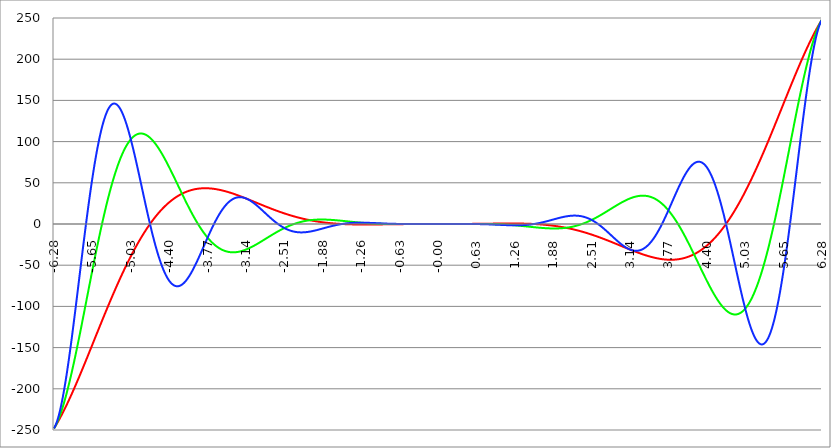
| Category | Series 1 | Series 0 | Series 2 |
|---|---|---|---|
| -6.283185307179586 | -248.05 | -248.05 | -248.05 |
| -6.276902121872407 | -247.302 | -247.287 | -247.263 |
| -6.270618936565228 | -246.545 | -246.487 | -246.39 |
| -6.264335751258049 | -245.781 | -245.65 | -245.432 |
| -6.25805256595087 | -245.008 | -244.776 | -244.389 |
| -6.25176938064369 | -244.227 | -243.866 | -243.264 |
| -6.245486195336511 | -243.439 | -242.92 | -242.056 |
| -6.23920301002933 | -242.643 | -241.938 | -240.766 |
| -6.232919824722153 | -241.839 | -240.922 | -239.397 |
| -6.226636639414973 | -241.027 | -239.871 | -237.947 |
| -6.220353454107794 | -240.208 | -238.785 | -236.42 |
| -6.214070268800615 | -239.381 | -237.665 | -234.815 |
| -6.207787083493435 | -238.547 | -236.512 | -233.133 |
| -6.201503898186257 | -237.706 | -235.326 | -231.377 |
| -6.195220712879077 | -236.858 | -234.107 | -229.546 |
| -6.188937527571898 | -236.002 | -232.856 | -227.642 |
| -6.182654342264719 | -235.14 | -231.572 | -225.666 |
| -6.17637115695754 | -234.271 | -230.258 | -223.62 |
| -6.170087971650361 | -233.394 | -228.912 | -221.504 |
| -6.163804786343182 | -232.512 | -227.535 | -219.32 |
| -6.157521601036002 | -231.622 | -226.128 | -217.068 |
| -6.151238415728823 | -230.726 | -224.692 | -214.751 |
| -6.144955230421644 | -229.823 | -223.225 | -212.369 |
| -6.138672045114464 | -228.914 | -221.73 | -209.924 |
| -6.132388859807286 | -227.999 | -220.207 | -207.417 |
| -6.126105674500106 | -227.077 | -218.655 | -204.849 |
| -6.119822489192927 | -226.149 | -217.076 | -202.222 |
| -6.113539303885748 | -225.216 | -215.469 | -199.537 |
| -6.107256118578569 | -224.276 | -213.836 | -196.795 |
| -6.10097293327139 | -223.33 | -212.176 | -193.998 |
| -6.09468974796421 | -222.379 | -210.491 | -191.146 |
| -6.088406562657031 | -221.422 | -208.78 | -188.243 |
| -6.082123377349852 | -220.459 | -207.044 | -185.288 |
| -6.075840192042672 | -219.491 | -205.284 | -182.283 |
| -6.069557006735494 | -218.517 | -203.499 | -179.23 |
| -6.063273821428314 | -217.538 | -201.691 | -176.13 |
| -6.056990636121135 | -216.553 | -199.86 | -172.985 |
| -6.050707450813956 | -215.564 | -198.006 | -169.796 |
| -6.044424265506777 | -214.569 | -196.13 | -166.564 |
| -6.038141080199597 | -213.569 | -194.232 | -163.291 |
| -6.031857894892418 | -212.564 | -192.313 | -159.979 |
| -6.025574709585239 | -211.555 | -190.373 | -156.628 |
| -6.01929152427806 | -210.54 | -188.413 | -153.241 |
| -6.013008338970881 | -209.521 | -186.433 | -149.819 |
| -6.006725153663701 | -208.497 | -184.434 | -146.363 |
| -6.000441968356522 | -207.469 | -182.415 | -142.875 |
| -5.994158783049343 | -206.437 | -180.378 | -139.356 |
| -5.987875597742164 | -205.4 | -178.323 | -135.809 |
| -5.981592412434984 | -204.358 | -176.251 | -132.233 |
| -5.975309227127805 | -203.313 | -174.161 | -128.632 |
| -5.969026041820626 | -202.263 | -172.055 | -125.005 |
| -5.962742856513447 | -201.209 | -169.933 | -121.356 |
| -5.956459671206268 | -200.152 | -167.795 | -117.685 |
| -5.950176485899088 | -199.09 | -165.642 | -113.995 |
| -5.94389330059191 | -198.025 | -163.475 | -110.285 |
| -5.93761011528473 | -196.956 | -161.293 | -106.559 |
| -5.931326929977551 | -195.884 | -159.097 | -102.816 |
| -5.925043744670372 | -194.807 | -156.888 | -99.06 |
| -5.918760559363193 | -193.728 | -154.667 | -95.291 |
| -5.912477374056014 | -192.645 | -152.433 | -91.511 |
| -5.906194188748834 | -191.559 | -150.187 | -87.722 |
| -5.899911003441655 | -190.469 | -147.93 | -83.924 |
| -5.893627818134476 | -189.377 | -145.662 | -80.12 |
| -5.887344632827297 | -188.281 | -143.383 | -76.31 |
| -5.881061447520117 | -187.182 | -141.094 | -72.497 |
| -5.874778262212938 | -186.081 | -138.796 | -68.681 |
| -5.868495076905759 | -184.976 | -136.489 | -64.865 |
| -5.86221189159858 | -183.869 | -134.173 | -61.049 |
| -5.855928706291401 | -182.759 | -131.85 | -57.235 |
| -5.849645520984221 | -181.647 | -129.518 | -53.424 |
| -5.843362335677042 | -180.532 | -127.179 | -49.619 |
| -5.837079150369863 | -179.415 | -124.834 | -45.819 |
| -5.830795965062684 | -178.295 | -122.482 | -42.028 |
| -5.824512779755505 | -177.173 | -120.125 | -38.245 |
| -5.818229594448325 | -176.049 | -117.762 | -34.472 |
| -5.811946409141146 | -174.923 | -115.394 | -30.711 |
| -5.805663223833967 | -173.794 | -113.022 | -26.963 |
| -5.799380038526788 | -172.664 | -110.645 | -23.23 |
| -5.793096853219609 | -171.532 | -108.266 | -19.512 |
| -5.78681366791243 | -170.398 | -105.883 | -15.811 |
| -5.780530482605251 | -169.262 | -103.497 | -12.128 |
| -5.774247297298071 | -168.124 | -101.109 | -8.465 |
| -5.767964111990892 | -166.985 | -98.719 | -4.822 |
| -5.761680926683713 | -165.845 | -96.328 | -1.202 |
| -5.755397741376534 | -164.703 | -93.936 | 2.396 |
| -5.749114556069355 | -163.56 | -91.544 | 5.969 |
| -5.742831370762175 | -162.415 | -89.151 | 9.516 |
| -5.736548185454996 | -161.269 | -86.759 | 13.037 |
| -5.730265000147816 | -160.122 | -84.367 | 16.53 |
| -5.723981814840638 | -158.974 | -81.977 | 19.994 |
| -5.717698629533459 | -157.825 | -79.588 | 23.428 |
| -5.711415444226279 | -156.675 | -77.201 | 26.83 |
| -5.7051322589191 | -155.524 | -74.817 | 30.201 |
| -5.698849073611921 | -154.372 | -72.436 | 33.538 |
| -5.692565888304742 | -153.219 | -70.058 | 36.84 |
| -5.686282702997562 | -152.066 | -67.683 | 40.108 |
| -5.679999517690383 | -150.913 | -65.313 | 43.339 |
| -5.673716332383204 | -149.758 | -62.947 | 46.532 |
| -5.667433147076025 | -148.604 | -60.585 | 49.687 |
| -5.661149961768846 | -147.449 | -58.229 | 52.803 |
| -5.654866776461667 | -146.293 | -55.879 | 55.879 |
| -5.648583591154487 | -145.138 | -53.535 | 58.914 |
| -5.642300405847308 | -143.982 | -51.197 | 61.907 |
| -5.63601722054013 | -142.826 | -48.866 | 64.857 |
| -5.62973403523295 | -141.67 | -46.541 | 67.763 |
| -5.623450849925771 | -140.514 | -44.225 | 70.625 |
| -5.617167664618591 | -139.359 | -41.916 | 73.442 |
| -5.610884479311412 | -138.203 | -39.616 | 76.213 |
| -5.604601294004233 | -137.048 | -37.324 | 78.938 |
| -5.598318108697054 | -135.893 | -35.041 | 81.614 |
| -5.592034923389875 | -134.738 | -32.767 | 84.243 |
| -5.585751738082695 | -133.584 | -30.503 | 86.823 |
| -5.579468552775516 | -132.43 | -28.249 | 89.354 |
| -5.573185367468337 | -131.276 | -26.005 | 91.834 |
| -5.566902182161157 | -130.124 | -23.772 | 94.264 |
| -5.560618996853979 | -128.972 | -21.549 | 96.643 |
| -5.5543358115468 | -127.821 | -19.338 | 98.97 |
| -5.54805262623962 | -126.67 | -17.139 | 101.245 |
| -5.54176944093244 | -125.521 | -14.952 | 103.466 |
| -5.535486255625262 | -124.372 | -12.777 | 105.635 |
| -5.529203070318083 | -123.224 | -10.614 | 107.75 |
| -5.522919885010904 | -122.078 | -8.464 | 109.81 |
| -5.516636699703724 | -120.932 | -6.328 | 111.816 |
| -5.510353514396545 | -119.788 | -4.205 | 113.767 |
| -5.504070329089366 | -118.645 | -2.095 | 115.663 |
| -5.497787143782186 | -117.503 | 0 | 117.503 |
| -5.491503958475008 | -116.362 | 2.081 | 119.287 |
| -5.485220773167828 | -115.223 | 4.147 | 121.015 |
| -5.47893758786065 | -114.086 | 6.199 | 122.686 |
| -5.47265440255347 | -112.95 | 8.235 | 124.3 |
| -5.466371217246291 | -111.815 | 10.256 | 125.857 |
| -5.460088031939112 | -110.682 | 12.262 | 127.357 |
| -5.453804846631932 | -109.551 | 14.251 | 128.799 |
| -5.447521661324753 | -108.422 | 16.224 | 130.184 |
| -5.441238476017574 | -107.294 | 18.181 | 131.512 |
| -5.434955290710395 | -106.168 | 20.121 | 132.781 |
| -5.428672105403215 | -105.044 | 22.044 | 133.992 |
| -5.422388920096036 | -103.922 | 23.951 | 135.146 |
| -5.416105734788857 | -102.802 | 25.839 | 136.241 |
| -5.409822549481678 | -101.685 | 27.71 | 137.279 |
| -5.403539364174499 | -100.569 | 29.564 | 138.258 |
| -5.39725617886732 | -99.455 | 31.399 | 139.18 |
| -5.39097299356014 | -98.344 | 33.216 | 140.043 |
| -5.384689808252961 | -97.235 | 35.015 | 140.849 |
| -5.378406622945782 | -96.128 | 36.795 | 141.597 |
| -5.372123437638603 | -95.024 | 38.556 | 142.287 |
| -5.365840252331424 | -93.922 | 40.299 | 142.919 |
| -5.359557067024244 | -92.823 | 42.022 | 143.495 |
| -5.353273881717065 | -91.726 | 43.725 | 144.013 |
| -5.346990696409886 | -90.631 | 45.409 | 144.474 |
| -5.340707511102707 | -89.54 | 47.074 | 144.878 |
| -5.334424325795528 | -88.451 | 48.718 | 145.226 |
| -5.328141140488348 | -87.364 | 50.343 | 145.517 |
| -5.32185795518117 | -86.281 | 51.947 | 145.753 |
| -5.31557476987399 | -85.2 | 53.531 | 145.933 |
| -5.30929158456681 | -84.122 | 55.094 | 146.057 |
| -5.303008399259631 | -83.047 | 56.637 | 146.126 |
| -5.296725213952453 | -81.975 | 58.159 | 146.141 |
| -5.290442028645273 | -80.906 | 59.66 | 146.102 |
| -5.284158843338094 | -79.84 | 61.139 | 146.008 |
| -5.277875658030915 | -78.777 | 62.598 | 145.861 |
| -5.271592472723735 | -77.718 | 64.036 | 145.661 |
| -5.265309287416557 | -76.661 | 65.452 | 145.408 |
| -5.259026102109377 | -75.608 | 66.846 | 145.103 |
| -5.252742916802198 | -74.558 | 68.219 | 144.747 |
| -5.246459731495019 | -73.511 | 69.57 | 144.339 |
| -5.24017654618784 | -72.468 | 70.9 | 143.881 |
| -5.23389336088066 | -71.427 | 72.207 | 143.373 |
| -5.227610175573481 | -70.391 | 73.493 | 142.815 |
| -5.221326990266302 | -69.358 | 74.756 | 142.207 |
| -5.215043804959122 | -68.328 | 75.997 | 141.552 |
| -5.208760619651944 | -67.302 | 77.216 | 140.849 |
| -5.202477434344764 | -66.279 | 78.413 | 140.098 |
| -5.196194249037585 | -65.26 | 79.588 | 139.301 |
| -5.189911063730406 | -64.245 | 80.74 | 138.458 |
| -5.183627878423227 | -63.234 | 81.869 | 137.569 |
| -5.177344693116048 | -62.226 | 82.976 | 136.636 |
| -5.171061507808868 | -61.222 | 84.061 | 135.659 |
| -5.164778322501689 | -60.221 | 85.123 | 134.638 |
| -5.15849513719451 | -59.225 | 86.162 | 133.575 |
| -5.152211951887331 | -58.233 | 87.179 | 132.47 |
| -5.145928766580152 | -57.244 | 88.172 | 131.324 |
| -5.139645581272972 | -56.259 | 89.144 | 130.137 |
| -5.133362395965793 | -55.279 | 90.092 | 128.911 |
| -5.127079210658614 | -54.302 | 91.018 | 127.645 |
| -5.120796025351435 | -53.329 | 91.921 | 126.342 |
| -5.114512840044256 | -52.361 | 92.802 | 125.001 |
| -5.108229654737076 | -51.396 | 93.659 | 123.623 |
| -5.101946469429897 | -50.436 | 94.494 | 122.209 |
| -5.095663284122718 | -49.48 | 95.306 | 120.761 |
| -5.08938009881554 | -48.528 | 96.096 | 119.278 |
| -5.08309691350836 | -47.58 | 96.862 | 117.762 |
| -5.07681372820118 | -46.636 | 97.606 | 116.213 |
| -5.070530542894002 | -45.697 | 98.328 | 114.632 |
| -5.064247357586822 | -44.762 | 99.027 | 113.02 |
| -5.057964172279643 | -43.832 | 99.703 | 111.378 |
| -5.051680986972464 | -42.906 | 100.356 | 109.707 |
| -5.045397801665285 | -41.984 | 100.988 | 108.007 |
| -5.039114616358106 | -41.067 | 101.596 | 106.28 |
| -5.032831431050926 | -40.154 | 102.183 | 104.526 |
| -5.026548245743747 | -39.246 | 102.747 | 102.747 |
| -5.020265060436568 | -38.342 | 103.288 | 100.942 |
| -5.013981875129389 | -37.443 | 103.808 | 99.113 |
| -5.00769868982221 | -36.548 | 104.305 | 97.261 |
| -5.00141550451503 | -35.658 | 104.78 | 95.386 |
| -4.995132319207851 | -34.772 | 105.233 | 93.49 |
| -4.98884913390067 | -33.891 | 105.664 | 91.574 |
| -4.982565948593493 | -33.015 | 106.073 | 89.637 |
| -4.976282763286313 | -32.143 | 106.461 | 87.682 |
| -4.969999577979134 | -31.277 | 106.827 | 85.709 |
| -4.963716392671955 | -30.414 | 107.171 | 83.719 |
| -4.957433207364776 | -29.557 | 107.494 | 81.713 |
| -4.951150022057597 | -28.704 | 107.795 | 79.691 |
| -4.944866836750418 | -27.856 | 108.075 | 77.655 |
| -4.938583651443238 | -27.013 | 108.333 | 75.606 |
| -4.932300466136059 | -26.175 | 108.571 | 73.543 |
| -4.92601728082888 | -25.342 | 108.788 | 71.469 |
| -4.9197340955217 | -24.513 | 108.983 | 69.385 |
| -4.913450910214521 | -23.69 | 109.158 | 67.29 |
| -4.907167724907342 | -22.871 | 109.313 | 65.186 |
| -4.900884539600163 | -22.057 | 109.447 | 63.074 |
| -4.894601354292984 | -21.248 | 109.56 | 60.954 |
| -4.888318168985805 | -20.444 | 109.653 | 58.828 |
| -4.882034983678625 | -19.645 | 109.726 | 56.696 |
| -4.875751798371446 | -18.851 | 109.779 | 54.56 |
| -4.869468613064267 | -18.062 | 109.812 | 52.419 |
| -4.863185427757088 | -17.279 | 109.826 | 50.276 |
| -4.856902242449909 | -16.5 | 109.82 | 48.13 |
| -4.85061905714273 | -15.726 | 109.794 | 45.983 |
| -4.84433587183555 | -14.957 | 109.749 | 43.835 |
| -4.838052686528371 | -14.193 | 109.685 | 41.688 |
| -4.831769501221192 | -13.434 | 109.602 | 39.541 |
| -4.825486315914013 | -12.681 | 109.501 | 37.397 |
| -4.819203130606833 | -11.932 | 109.38 | 35.255 |
| -4.812919945299654 | -11.189 | 109.242 | 33.116 |
| -4.806636759992475 | -10.451 | 109.084 | 30.982 |
| -4.800353574685296 | -9.718 | 108.909 | 28.853 |
| -4.794070389378117 | -8.99 | 108.716 | 26.73 |
| -4.787787204070938 | -8.267 | 108.505 | 24.614 |
| -4.781504018763758 | -7.55 | 108.276 | 22.505 |
| -4.77522083345658 | -6.837 | 108.029 | 20.404 |
| -4.7689376481494 | -6.13 | 107.766 | 18.311 |
| -4.762654462842221 | -5.428 | 107.485 | 16.229 |
| -4.756371277535042 | -4.731 | 107.188 | 14.157 |
| -4.750088092227862 | -4.04 | 106.873 | 12.096 |
| -4.743804906920683 | -3.353 | 106.542 | 10.046 |
| -4.737521721613504 | -2.672 | 106.195 | 8.009 |
| -4.731238536306324 | -1.996 | 105.832 | 5.986 |
| -4.724955350999146 | -1.326 | 105.452 | 3.976 |
| -4.718672165691966 | -0.66 | 105.057 | 1.98 |
| -4.712388980384787 | 0 | 104.646 | 0 |
| -4.706105795077608 | 0.655 | 104.22 | -1.965 |
| -4.699822609770429 | 1.304 | 103.778 | -3.913 |
| -4.69353942446325 | 1.949 | 103.322 | -5.844 |
| -4.68725623915607 | 2.588 | 102.851 | -7.757 |
| -4.680973053848891 | 3.222 | 102.365 | -9.652 |
| -4.674689868541712 | 3.85 | 101.864 | -11.529 |
| -4.668406683234533 | 4.473 | 101.35 | -13.386 |
| -4.662123497927354 | 5.091 | 100.821 | -15.223 |
| -4.655840312620174 | 5.704 | 100.279 | -17.039 |
| -4.649557127312995 | 6.311 | 99.723 | -18.835 |
| -4.643273942005816 | 6.914 | 99.154 | -20.609 |
| -4.636990756698637 | 7.51 | 98.572 | -22.36 |
| -4.630707571391458 | 8.102 | 97.976 | -24.09 |
| -4.624424386084279 | 8.688 | 97.368 | -25.796 |
| -4.618141200777099 | 9.269 | 96.748 | -27.478 |
| -4.61185801546992 | 9.845 | 96.115 | -29.137 |
| -4.605574830162741 | 10.415 | 95.47 | -30.771 |
| -4.599291644855561 | 10.98 | 94.813 | -32.38 |
| -4.593008459548383 | 11.54 | 94.144 | -33.964 |
| -4.586725274241203 | 12.094 | 93.464 | -35.522 |
| -4.580442088934024 | 12.643 | 92.773 | -37.055 |
| -4.574158903626845 | 13.187 | 92.071 | -38.56 |
| -4.567875718319666 | 13.726 | 91.358 | -40.039 |
| -4.561592533012487 | 14.259 | 90.634 | -41.49 |
| -4.555309347705307 | 14.787 | 89.9 | -42.914 |
| -4.549026162398128 | 15.31 | 89.156 | -44.31 |
| -4.542742977090949 | 15.828 | 88.402 | -45.678 |
| -4.53645979178377 | 16.34 | 87.638 | -47.017 |
| -4.530176606476591 | 16.847 | 86.865 | -48.328 |
| -4.523893421169412 | 17.349 | 86.083 | -49.609 |
| -4.517610235862232 | 17.845 | 85.291 | -50.861 |
| -4.511327050555053 | 18.336 | 84.491 | -52.084 |
| -4.505043865247874 | 18.822 | 83.682 | -53.276 |
| -4.498760679940694 | 19.303 | 82.865 | -54.439 |
| -4.492477494633515 | 19.779 | 82.04 | -55.572 |
| -4.486194309326336 | 20.249 | 81.206 | -56.674 |
| -4.479911124019157 | 20.714 | 80.365 | -57.745 |
| -4.473627938711977 | 21.174 | 79.517 | -58.786 |
| -4.467344753404799 | 21.629 | 78.661 | -59.795 |
| -4.46106156809762 | 22.079 | 77.798 | -60.774 |
| -4.45477838279044 | 22.523 | 76.929 | -61.722 |
| -4.44849519748326 | 22.962 | 76.053 | -62.638 |
| -4.442212012176082 | 23.396 | 75.17 | -63.523 |
| -4.435928826868903 | 23.825 | 74.281 | -64.376 |
| -4.429645641561723 | 24.249 | 73.387 | -65.198 |
| -4.423362456254544 | 24.668 | 72.486 | -65.988 |
| -4.417079270947365 | 25.081 | 71.581 | -66.747 |
| -4.410796085640185 | 25.49 | 70.669 | -67.473 |
| -4.404512900333007 | 25.893 | 69.753 | -68.169 |
| -4.398229715025827 | 26.292 | 68.832 | -68.832 |
| -4.391946529718648 | 26.685 | 67.906 | -69.464 |
| -4.38566334441147 | 27.073 | 66.976 | -70.064 |
| -4.37938015910429 | 27.456 | 66.042 | -70.633 |
| -4.373096973797111 | 27.834 | 65.104 | -71.17 |
| -4.366813788489932 | 28.207 | 64.161 | -71.675 |
| -4.360530603182752 | 28.575 | 63.216 | -72.149 |
| -4.354247417875573 | 28.938 | 62.267 | -72.591 |
| -4.347964232568394 | 29.296 | 61.314 | -73.002 |
| -4.341681047261215 | 29.649 | 60.359 | -73.382 |
| -4.335397861954035 | 29.997 | 59.401 | -73.731 |
| -4.329114676646856 | 30.34 | 58.441 | -74.049 |
| -4.322831491339677 | 30.679 | 57.478 | -74.337 |
| -4.316548306032498 | 31.012 | 56.513 | -74.593 |
| -4.310265120725319 | 31.34 | 55.546 | -74.819 |
| -4.30398193541814 | 31.664 | 54.578 | -75.015 |
| -4.29769875011096 | 31.982 | 53.608 | -75.18 |
| -4.291415564803781 | 32.296 | 52.636 | -75.316 |
| -4.285132379496602 | 32.605 | 51.664 | -75.421 |
| -4.278849194189422 | 32.909 | 50.69 | -75.498 |
| -4.272566008882244 | 33.209 | 49.716 | -75.545 |
| -4.266282823575064 | 33.503 | 48.741 | -75.562 |
| -4.259999638267885 | 33.793 | 47.766 | -75.551 |
| -4.253716452960706 | 34.078 | 46.791 | -75.512 |
| -4.247433267653527 | 34.358 | 45.815 | -75.444 |
| -4.241150082346347 | 34.634 | 44.84 | -75.348 |
| -4.234866897039168 | 34.904 | 43.866 | -75.224 |
| -4.228583711731989 | 35.171 | 42.892 | -75.073 |
| -4.22230052642481 | 35.432 | 41.918 | -74.894 |
| -4.216017341117631 | 35.689 | 40.946 | -74.689 |
| -4.209734155810452 | 35.941 | 39.975 | -74.457 |
| -4.203450970503273 | 36.188 | 39.005 | -74.199 |
| -4.197167785196093 | 36.431 | 38.037 | -73.915 |
| -4.190884599888914 | 36.67 | 37.07 | -73.605 |
| -4.184601414581734 | 36.904 | 36.105 | -73.27 |
| -4.178318229274556 | 37.133 | 35.142 | -72.911 |
| -4.172035043967377 | 37.358 | 34.182 | -72.526 |
| -4.165751858660197 | 37.578 | 33.223 | -72.118 |
| -4.159468673353018 | 37.794 | 32.267 | -71.685 |
| -4.153185488045839 | 38.005 | 31.314 | -71.23 |
| -4.14690230273866 | 38.212 | 30.364 | -70.751 |
| -4.140619117431481 | 38.414 | 29.416 | -70.25 |
| -4.134335932124301 | 38.612 | 28.472 | -69.726 |
| -4.128052746817122 | 38.806 | 27.531 | -69.181 |
| -4.121769561509943 | 38.995 | 26.594 | -68.614 |
| -4.115486376202764 | 39.18 | 25.66 | -68.026 |
| -4.109203190895584 | 39.361 | 24.73 | -67.418 |
| -4.102920005588405 | 39.537 | 23.804 | -66.789 |
| -4.096636820281226 | 39.709 | 22.882 | -66.141 |
| -4.090353634974047 | 39.877 | 21.964 | -65.473 |
| -4.084070449666868 | 40.04 | 21.05 | -64.787 |
| -4.077787264359689 | 40.2 | 20.141 | -64.082 |
| -4.071504079052509 | 40.355 | 19.237 | -63.359 |
| -4.06522089374533 | 40.506 | 18.337 | -62.618 |
| -4.058937708438151 | 40.653 | 17.443 | -61.861 |
| -4.052654523130972 | 40.796 | 16.553 | -61.087 |
| -4.046371337823793 | 40.934 | 15.668 | -60.296 |
| -4.040088152516613 | 41.069 | 14.789 | -59.49 |
| -4.033804967209434 | 41.199 | 13.915 | -58.669 |
| -4.027521781902255 | 41.326 | 13.047 | -57.832 |
| -4.021238596595076 | 41.448 | 12.184 | -56.982 |
| -4.014955411287897 | 41.567 | 11.328 | -56.117 |
| -4.008672225980717 | 41.682 | 10.477 | -55.239 |
| -4.002389040673538 | 41.792 | 9.632 | -54.349 |
| -3.996105855366359 | 41.899 | 8.793 | -53.445 |
| -3.989822670059179 | 42.002 | 7.96 | -52.53 |
| -3.983539484752 | 42.101 | 7.134 | -51.603 |
| -3.97725629944482 | 42.196 | 6.314 | -50.666 |
| -3.97097311413764 | 42.287 | 5.501 | -49.717 |
| -3.96468992883046 | 42.375 | 4.694 | -48.759 |
| -3.958406743523281 | 42.458 | 3.895 | -47.79 |
| -3.952123558216101 | 42.539 | 3.102 | -46.813 |
| -3.945840372908922 | 42.615 | 2.316 | -45.827 |
| -3.939557187601742 | 42.687 | 1.537 | -44.833 |
| -3.933274002294562 | 42.756 | 0.765 | -43.831 |
| -3.926990816987382 | 42.822 | 0 | -42.822 |
| -3.920707631680203 | 42.883 | -0.757 | -41.806 |
| -3.914424446373023 | 42.942 | -1.507 | -40.783 |
| -3.908141261065844 | 42.996 | -2.25 | -39.755 |
| -3.901858075758664 | 43.047 | -2.985 | -38.721 |
| -3.895574890451484 | 43.095 | -3.712 | -37.683 |
| -3.889291705144305 | 43.139 | -4.432 | -36.64 |
| -3.883008519837125 | 43.179 | -5.143 | -35.593 |
| -3.876725334529945 | 43.216 | -5.847 | -34.542 |
| -3.870442149222766 | 43.25 | -6.543 | -33.488 |
| -3.864158963915586 | 43.28 | -7.232 | -32.431 |
| -3.857875778608407 | 43.307 | -7.912 | -31.373 |
| -3.851592593301227 | 43.331 | -8.584 | -30.312 |
| -3.845309407994047 | 43.351 | -9.247 | -29.25 |
| -3.839026222686868 | 43.368 | -9.903 | -28.187 |
| -3.832743037379688 | 43.382 | -10.55 | -27.124 |
| -3.826459852072508 | 43.392 | -11.189 | -26.061 |
| -3.820176666765329 | 43.4 | -11.82 | -24.998 |
| -3.813893481458149 | 43.404 | -12.442 | -23.935 |
| -3.807610296150969 | 43.405 | -13.055 | -22.875 |
| -3.80132711084379 | 43.403 | -13.66 | -21.815 |
| -3.79504392553661 | 43.398 | -14.257 | -20.758 |
| -3.78876074022943 | 43.389 | -14.845 | -19.703 |
| -3.782477554922251 | 43.378 | -15.424 | -18.651 |
| -3.776194369615071 | 43.364 | -15.995 | -17.602 |
| -3.769911184307892 | 43.346 | -16.557 | -16.557 |
| -3.763627999000712 | 43.326 | -17.11 | -15.516 |
| -3.757344813693532 | 43.303 | -17.654 | -14.479 |
| -3.751061628386352 | 43.276 | -18.19 | -13.447 |
| -3.744778443079173 | 43.247 | -18.717 | -12.42 |
| -3.738495257771993 | 43.215 | -19.235 | -11.398 |
| -3.732212072464814 | 43.181 | -19.744 | -10.382 |
| -3.725928887157634 | 43.143 | -20.244 | -9.373 |
| -3.719645701850454 | 43.103 | -20.735 | -8.37 |
| -3.713362516543275 | 43.06 | -21.218 | -7.374 |
| -3.707079331236095 | 43.014 | -21.691 | -6.385 |
| -3.700796145928915 | 42.965 | -22.156 | -5.404 |
| -3.694512960621736 | 42.914 | -22.611 | -4.43 |
| -3.688229775314556 | 42.86 | -23.058 | -3.465 |
| -3.681946590007376 | 42.804 | -23.495 | -2.508 |
| -3.675663404700197 | 42.744 | -23.924 | -1.56 |
| -3.669380219393017 | 42.683 | -24.344 | -0.621 |
| -3.663097034085838 | 42.619 | -24.754 | 0.309 |
| -3.656813848778658 | 42.552 | -25.156 | 1.229 |
| -3.650530663471478 | 42.483 | -25.549 | 2.139 |
| -3.644247478164299 | 42.411 | -25.933 | 3.039 |
| -3.63796429285712 | 42.337 | -26.308 | 3.928 |
| -3.631681107549939 | 42.261 | -26.674 | 4.807 |
| -3.62539792224276 | 42.182 | -27.031 | 5.675 |
| -3.61911473693558 | 42.1 | -27.379 | 6.532 |
| -3.612831551628401 | 42.017 | -27.718 | 7.377 |
| -3.606548366321221 | 41.931 | -28.048 | 8.211 |
| -3.600265181014041 | 41.843 | -28.37 | 9.032 |
| -3.593981995706862 | 41.753 | -28.683 | 9.842 |
| -3.587698810399682 | 41.66 | -28.986 | 10.639 |
| -3.581415625092502 | 41.565 | -29.281 | 11.424 |
| -3.575132439785323 | 41.468 | -29.568 | 12.196 |
| -3.568849254478143 | 41.369 | -29.845 | 12.956 |
| -3.562566069170964 | 41.268 | -30.114 | 13.702 |
| -3.556282883863784 | 41.165 | -30.374 | 14.435 |
| -3.549999698556604 | 41.059 | -30.626 | 15.155 |
| -3.543716513249425 | 40.952 | -30.869 | 15.861 |
| -3.537433327942245 | 40.843 | -31.103 | 16.553 |
| -3.531150142635065 | 40.731 | -31.329 | 17.232 |
| -3.524866957327886 | 40.618 | -31.546 | 17.897 |
| -3.518583772020706 | 40.503 | -31.755 | 18.548 |
| -3.512300586713526 | 40.385 | -31.955 | 19.184 |
| -3.506017401406347 | 40.266 | -32.147 | 19.806 |
| -3.499734216099167 | 40.145 | -32.331 | 20.414 |
| -3.493451030791987 | 40.023 | -32.507 | 21.007 |
| -3.487167845484808 | 39.898 | -32.674 | 21.586 |
| -3.480884660177628 | 39.772 | -32.833 | 22.15 |
| -3.474601474870449 | 39.644 | -32.984 | 22.699 |
| -3.468318289563269 | 39.514 | -33.126 | 23.234 |
| -3.462035104256089 | 39.383 | -33.261 | 23.753 |
| -3.45575191894891 | 39.249 | -33.388 | 24.258 |
| -3.44946873364173 | 39.115 | -33.506 | 24.747 |
| -3.44318554833455 | 38.978 | -33.617 | 25.222 |
| -3.436902363027371 | 38.84 | -33.72 | 25.681 |
| -3.430619177720191 | 38.701 | -33.816 | 26.125 |
| -3.424335992413011 | 38.56 | -33.903 | 26.554 |
| -3.418052807105832 | 38.417 | -33.983 | 26.968 |
| -3.411769621798652 | 38.273 | -34.055 | 27.367 |
| -3.405486436491473 | 38.127 | -34.12 | 27.751 |
| -3.399203251184293 | 37.98 | -34.178 | 28.119 |
| -3.392920065877113 | 37.832 | -34.228 | 28.473 |
| -3.386636880569934 | 37.682 | -34.27 | 28.811 |
| -3.380353695262754 | 37.531 | -34.306 | 29.134 |
| -3.374070509955574 | 37.378 | -34.334 | 29.442 |
| -3.367787324648395 | 37.224 | -34.355 | 29.735 |
| -3.361504139341215 | 37.069 | -34.369 | 30.013 |
| -3.355220954034035 | 36.913 | -34.376 | 30.276 |
| -3.348937768726855 | 36.755 | -34.376 | 30.524 |
| -3.342654583419676 | 36.596 | -34.369 | 30.758 |
| -3.336371398112496 | 36.436 | -34.356 | 30.976 |
| -3.330088212805317 | 36.275 | -34.336 | 31.18 |
| -3.323805027498137 | 36.112 | -34.309 | 31.369 |
| -3.317521842190957 | 35.949 | -34.276 | 31.544 |
| -3.311238656883778 | 35.784 | -34.236 | 31.704 |
| -3.304955471576598 | 35.619 | -34.189 | 31.85 |
| -3.298672286269419 | 35.452 | -34.137 | 31.981 |
| -3.292389100962239 | 35.284 | -34.078 | 32.099 |
| -3.286105915655059 | 35.115 | -34.013 | 32.202 |
| -3.27982273034788 | 34.945 | -33.942 | 32.291 |
| -3.2735395450407 | 34.775 | -33.865 | 32.367 |
| -3.26725635973352 | 34.603 | -33.782 | 32.429 |
| -3.260973174426341 | 34.43 | -33.693 | 32.477 |
| -3.254689989119161 | 34.257 | -33.599 | 32.511 |
| -3.248406803811982 | 34.082 | -33.498 | 32.533 |
| -3.242123618504802 | 33.907 | -33.393 | 32.541 |
| -3.235840433197622 | 33.731 | -33.281 | 32.536 |
| -3.229557247890442 | 33.554 | -33.164 | 32.518 |
| -3.223274062583263 | 33.377 | -33.042 | 32.488 |
| -3.216990877276083 | 33.198 | -32.915 | 32.445 |
| -3.210707691968904 | 33.019 | -32.782 | 32.389 |
| -3.204424506661724 | 32.839 | -32.645 | 32.321 |
| -3.198141321354544 | 32.659 | -32.502 | 32.241 |
| -3.191858136047365 | 32.477 | -32.354 | 32.149 |
| -3.185574950740185 | 32.296 | -32.202 | 32.046 |
| -3.179291765433005 | 32.113 | -32.045 | 31.931 |
| -3.173008580125826 | 31.93 | -31.883 | 31.804 |
| -3.166725394818646 | 31.746 | -31.716 | 31.666 |
| -3.160442209511467 | 31.562 | -31.545 | 31.517 |
| -3.154159024204287 | 31.377 | -31.37 | 31.358 |
| -3.147875838897107 | 31.192 | -31.19 | 31.187 |
| -3.141592653589928 | 31.006 | -31.006 | 31.006 |
| -3.135309468282748 | 30.82 | -30.818 | 30.815 |
| -3.129026282975568 | 30.633 | -30.626 | 30.614 |
| -3.122743097668389 | 30.446 | -30.43 | 30.403 |
| -3.116459912361209 | 30.259 | -30.23 | 30.182 |
| -3.110176727054029 | 30.071 | -30.026 | 29.952 |
| -3.10389354174685 | 29.882 | -29.818 | 29.712 |
| -3.09761035643967 | 29.693 | -29.607 | 29.464 |
| -3.09132717113249 | 29.504 | -29.393 | 29.206 |
| -3.085043985825311 | 29.315 | -29.174 | 28.94 |
| -3.078760800518131 | 29.125 | -28.953 | 28.666 |
| -3.072477615210952 | 28.935 | -28.728 | 28.383 |
| -3.066194429903772 | 28.745 | -28.5 | 28.093 |
| -3.059911244596592 | 28.555 | -28.269 | 27.794 |
| -3.053628059289413 | 28.364 | -28.034 | 27.488 |
| -3.047344873982233 | 28.173 | -27.797 | 27.175 |
| -3.041061688675053 | 27.982 | -27.557 | 26.855 |
| -3.034778503367874 | 27.791 | -27.315 | 26.527 |
| -3.028495318060694 | 27.599 | -27.069 | 26.193 |
| -3.022212132753515 | 27.408 | -26.821 | 25.853 |
| -3.015928947446335 | 27.216 | -26.571 | 25.506 |
| -3.009645762139155 | 27.024 | -26.318 | 25.153 |
| -3.003362576831975 | 26.832 | -26.062 | 24.795 |
| -2.997079391524796 | 26.641 | -25.805 | 24.431 |
| -2.990796206217616 | 26.449 | -25.545 | 24.061 |
| -2.984513020910436 | 26.257 | -25.283 | 23.687 |
| -2.978229835603257 | 26.065 | -25.019 | 23.307 |
| -2.971946650296077 | 25.873 | -24.753 | 22.923 |
| -2.965663464988898 | 25.681 | -24.485 | 22.534 |
| -2.959380279681718 | 25.489 | -24.216 | 22.141 |
| -2.953097094374538 | 25.297 | -23.945 | 21.744 |
| -2.946813909067359 | 25.105 | -23.672 | 21.343 |
| -2.94053072376018 | 24.914 | -23.398 | 20.939 |
| -2.934247538453 | 24.722 | -23.122 | 20.531 |
| -2.92796435314582 | 24.531 | -22.845 | 20.12 |
| -2.92168116783864 | 24.339 | -22.566 | 19.707 |
| -2.915397982531461 | 24.148 | -22.287 | 19.29 |
| -2.909114797224281 | 23.957 | -22.006 | 18.871 |
| -2.902831611917101 | 23.767 | -21.724 | 18.449 |
| -2.896548426609922 | 23.576 | -21.441 | 18.026 |
| -2.890265241302742 | 23.386 | -21.158 | 17.6 |
| -2.883982055995562 | 23.196 | -20.873 | 17.173 |
| -2.877698870688383 | 23.006 | -20.588 | 16.745 |
| -2.871415685381203 | 22.816 | -20.302 | 16.315 |
| -2.865132500074023 | 22.627 | -20.015 | 15.884 |
| -2.858849314766844 | 22.438 | -19.728 | 15.452 |
| -2.852566129459664 | 22.249 | -19.44 | 15.019 |
| -2.846282944152485 | 22.061 | -19.152 | 14.586 |
| -2.839999758845305 | 21.872 | -18.864 | 14.153 |
| -2.833716573538125 | 21.685 | -18.575 | 13.719 |
| -2.827433388230946 | 21.497 | -18.287 | 13.286 |
| -2.821150202923766 | 21.31 | -17.998 | 12.853 |
| -2.814867017616586 | 21.124 | -17.709 | 12.42 |
| -2.808583832309407 | 20.937 | -17.42 | 11.988 |
| -2.802300647002227 | 20.752 | -17.131 | 11.557 |
| -2.796017461695047 | 20.566 | -16.842 | 11.127 |
| -2.789734276387867 | 20.381 | -16.554 | 10.698 |
| -2.783451091080688 | 20.197 | -16.265 | 10.27 |
| -2.777167905773509 | 20.013 | -15.978 | 9.844 |
| -2.770884720466329 | 19.829 | -15.69 | 9.419 |
| -2.764601535159149 | 19.646 | -15.403 | 8.997 |
| -2.75831834985197 | 19.464 | -15.117 | 8.576 |
| -2.75203516454479 | 19.281 | -14.831 | 8.157 |
| -2.74575197923761 | 19.1 | -14.545 | 7.741 |
| -2.739468793930431 | 18.919 | -14.261 | 7.327 |
| -2.733185608623251 | 18.738 | -13.977 | 6.916 |
| -2.726902423316071 | 18.559 | -13.694 | 6.508 |
| -2.720619238008892 | 18.379 | -13.412 | 6.102 |
| -2.714336052701712 | 18.2 | -13.131 | 5.7 |
| -2.708052867394532 | 18.022 | -12.85 | 5.301 |
| -2.701769682087352 | 17.845 | -12.571 | 4.905 |
| -2.695486496780173 | 17.668 | -12.293 | 4.512 |
| -2.689203311472993 | 17.491 | -12.016 | 4.123 |
| -2.682920126165814 | 17.316 | -11.74 | 3.738 |
| -2.676636940858634 | 17.141 | -11.466 | 3.356 |
| -2.670353755551454 | 16.966 | -11.192 | 2.979 |
| -2.664070570244275 | 16.793 | -10.921 | 2.605 |
| -2.657787384937095 | 16.619 | -10.65 | 2.236 |
| -2.651504199629916 | 16.447 | -10.381 | 1.871 |
| -2.645221014322736 | 16.275 | -10.113 | 1.51 |
| -2.638937829015556 | 16.104 | -9.847 | 1.154 |
| -2.632654643708377 | 15.934 | -9.583 | 0.802 |
| -2.626371458401197 | 15.764 | -9.32 | 0.455 |
| -2.620088273094018 | 15.596 | -9.058 | 0.113 |
| -2.613805087786838 | 15.427 | -8.799 | -0.224 |
| -2.607521902479658 | 15.26 | -8.541 | -0.557 |
| -2.601238717172478 | 15.093 | -8.285 | -0.884 |
| -2.594955531865299 | 14.928 | -8.031 | -1.207 |
| -2.588672346558119 | 14.762 | -7.778 | -1.524 |
| -2.58238916125094 | 14.598 | -7.528 | -1.836 |
| -2.57610597594376 | 14.435 | -7.279 | -2.143 |
| -2.56982279063658 | 14.272 | -7.032 | -2.444 |
| -2.563539605329401 | 14.11 | -6.788 | -2.74 |
| -2.557256420022221 | 13.949 | -6.545 | -3.03 |
| -2.550973234715042 | 13.788 | -6.304 | -3.315 |
| -2.544690049407862 | 13.629 | -6.066 | -3.595 |
| -2.538406864100682 | 13.47 | -5.83 | -3.868 |
| -2.532123678793503 | 13.312 | -5.595 | -4.136 |
| -2.525840493486323 | 13.155 | -5.363 | -4.398 |
| -2.519557308179143 | 12.999 | -5.133 | -4.655 |
| -2.513274122871964 | 12.843 | -4.906 | -4.906 |
| -2.506990937564784 | 12.689 | -4.68 | -5.151 |
| -2.500707752257604 | 12.535 | -4.457 | -5.39 |
| -2.494424566950425 | 12.382 | -4.236 | -5.623 |
| -2.488141381643245 | 12.23 | -4.018 | -5.85 |
| -2.481858196336065 | 12.079 | -3.802 | -6.071 |
| -2.475575011028886 | 11.929 | -3.588 | -6.287 |
| -2.469291825721706 | 11.78 | -3.377 | -6.496 |
| -2.463008640414527 | 11.631 | -3.168 | -6.7 |
| -2.456725455107347 | 11.484 | -2.961 | -6.897 |
| -2.450442269800167 | 11.337 | -2.757 | -7.089 |
| -2.444159084492988 | 11.192 | -2.556 | -7.274 |
| -2.437875899185808 | 11.047 | -2.356 | -7.454 |
| -2.431592713878628 | 10.903 | -2.16 | -7.627 |
| -2.425309528571449 | 10.76 | -1.966 | -7.795 |
| -2.419026343264269 | 10.618 | -1.774 | -7.957 |
| -2.412743157957089 | 10.477 | -1.585 | -8.112 |
| -2.40645997264991 | 10.337 | -1.399 | -8.262 |
| -2.40017678734273 | 10.198 | -1.215 | -8.406 |
| -2.393893602035551 | 10.059 | -1.033 | -8.544 |
| -2.387610416728371 | 9.922 | -0.855 | -8.676 |
| -2.381327231421191 | 9.786 | -0.678 | -8.802 |
| -2.375044046114012 | 9.65 | -0.505 | -8.923 |
| -2.368760860806832 | 9.516 | -0.334 | -9.037 |
| -2.362477675499652 | 9.382 | -0.166 | -9.146 |
| -2.356194490192473 | 9.25 | 0 | -9.25 |
| -2.349911304885293 | 9.118 | 0.163 | -9.347 |
| -2.343628119578113 | 8.987 | 0.323 | -9.439 |
| -2.337344934270934 | 8.857 | 0.481 | -9.525 |
| -2.331061748963754 | 8.729 | 0.636 | -9.606 |
| -2.324778563656574 | 8.601 | 0.789 | -9.681 |
| -2.318495378349395 | 8.474 | 0.939 | -9.751 |
| -2.312212193042215 | 8.348 | 1.086 | -9.815 |
| -2.305929007735036 | 8.224 | 1.231 | -9.874 |
| -2.299645822427856 | 8.1 | 1.372 | -9.928 |
| -2.293362637120676 | 7.977 | 1.512 | -9.976 |
| -2.287079451813496 | 7.855 | 1.648 | -10.019 |
| -2.280796266506317 | 7.734 | 1.782 | -10.058 |
| -2.274513081199137 | 7.614 | 1.914 | -10.091 |
| -2.268229895891957 | 7.495 | 2.042 | -10.118 |
| -2.261946710584778 | 7.377 | 2.169 | -10.142 |
| -2.255663525277598 | 7.26 | 2.292 | -10.16 |
| -2.249380339970419 | 7.144 | 2.413 | -10.173 |
| -2.24309715466324 | 7.029 | 2.531 | -10.182 |
| -2.23681396935606 | 6.915 | 2.647 | -10.185 |
| -2.23053078404888 | 6.802 | 2.76 | -10.185 |
| -2.2242475987417 | 6.69 | 2.87 | -10.18 |
| -2.217964413434521 | 6.579 | 2.978 | -10.17 |
| -2.211681228127341 | 6.468 | 3.083 | -10.156 |
| -2.205398042820161 | 6.359 | 3.186 | -10.137 |
| -2.199114857512981 | 6.251 | 3.286 | -10.115 |
| -2.192831672205802 | 6.144 | 3.384 | -10.088 |
| -2.186548486898622 | 6.038 | 3.479 | -10.057 |
| -2.180265301591443 | 5.933 | 3.572 | -10.022 |
| -2.173982116284263 | 5.829 | 3.662 | -9.983 |
| -2.167698930977084 | 5.725 | 3.75 | -9.941 |
| -2.161415745669904 | 5.623 | 3.835 | -9.894 |
| -2.155132560362724 | 5.522 | 3.918 | -9.844 |
| -2.148849375055545 | 5.422 | 3.998 | -9.79 |
| -2.142566189748365 | 5.322 | 4.076 | -9.733 |
| -2.136283004441185 | 5.224 | 4.151 | -9.672 |
| -2.129999819134006 | 5.127 | 4.224 | -9.609 |
| -2.123716633826826 | 5.03 | 4.295 | -9.541 |
| -2.117433448519646 | 4.935 | 4.363 | -9.471 |
| -2.111150263212467 | 4.841 | 4.429 | -9.397 |
| -2.104867077905287 | 4.747 | 4.493 | -9.321 |
| -2.098583892598107 | 4.655 | 4.554 | -9.242 |
| -2.092300707290928 | 4.563 | 4.613 | -9.159 |
| -2.086017521983748 | 4.473 | 4.67 | -9.074 |
| -2.079734336676569 | 4.383 | 4.724 | -8.987 |
| -2.073451151369389 | 4.294 | 4.776 | -8.897 |
| -2.06716796606221 | 4.207 | 4.827 | -8.804 |
| -2.06088478075503 | 4.12 | 4.874 | -8.709 |
| -2.05460159544785 | 4.034 | 4.92 | -8.612 |
| -2.04831841014067 | 3.95 | 4.964 | -8.512 |
| -2.042035224833491 | 3.866 | 5.005 | -8.41 |
| -2.035752039526311 | 3.783 | 5.044 | -8.307 |
| -2.029468854219131 | 3.701 | 5.082 | -8.201 |
| -2.023185668911951 | 3.62 | 5.117 | -8.093 |
| -2.016902483604772 | 3.54 | 5.15 | -7.984 |
| -2.010619298297592 | 3.461 | 5.181 | -7.873 |
| -2.004336112990412 | 3.383 | 5.21 | -7.76 |
| -1.998052927683233 | 3.305 | 5.237 | -7.646 |
| -1.991769742376054 | 3.229 | 5.263 | -7.53 |
| -1.985486557068874 | 3.154 | 5.286 | -7.413 |
| -1.979203371761694 | 3.079 | 5.307 | -7.295 |
| -1.972920186454515 | 3.006 | 5.327 | -7.175 |
| -1.966637001147335 | 2.933 | 5.345 | -7.054 |
| -1.960353815840155 | 2.861 | 5.36 | -6.933 |
| -1.954070630532976 | 2.79 | 5.375 | -6.81 |
| -1.947787445225796 | 2.72 | 5.387 | -6.686 |
| -1.941504259918616 | 2.651 | 5.397 | -6.562 |
| -1.935221074611437 | 2.583 | 5.406 | -6.437 |
| -1.928937889304257 | 2.516 | 5.413 | -6.311 |
| -1.922654703997078 | 2.449 | 5.419 | -6.185 |
| -1.916371518689898 | 2.384 | 5.423 | -6.058 |
| -1.910088333382718 | 2.319 | 5.425 | -5.93 |
| -1.903805148075539 | 2.256 | 5.426 | -5.803 |
| -1.897521962768359 | 2.193 | 5.425 | -5.675 |
| -1.891238777461179 | 2.131 | 5.422 | -5.547 |
| -1.884955592154 | 2.07 | 5.418 | -5.418 |
| -1.87867240684682 | 2.009 | 5.413 | -5.29 |
| -1.87238922153964 | 1.95 | 5.406 | -5.161 |
| -1.866106036232461 | 1.891 | 5.398 | -5.033 |
| -1.859822850925281 | 1.834 | 5.388 | -4.905 |
| -1.853539665618102 | 1.777 | 5.377 | -4.777 |
| -1.847256480310922 | 1.721 | 5.364 | -4.649 |
| -1.840973295003742 | 1.665 | 5.35 | -4.521 |
| -1.834690109696563 | 1.611 | 5.335 | -4.394 |
| -1.828406924389383 | 1.557 | 5.319 | -4.268 |
| -1.822123739082203 | 1.504 | 5.301 | -4.141 |
| -1.815840553775024 | 1.453 | 5.283 | -4.016 |
| -1.809557368467844 | 1.401 | 5.263 | -3.891 |
| -1.803274183160664 | 1.351 | 5.241 | -3.766 |
| -1.796990997853485 | 1.301 | 5.219 | -3.642 |
| -1.790707812546305 | 1.253 | 5.196 | -3.519 |
| -1.784424627239125 | 1.205 | 5.171 | -3.397 |
| -1.778141441931946 | 1.157 | 5.146 | -3.276 |
| -1.771858256624766 | 1.111 | 5.119 | -3.156 |
| -1.765575071317587 | 1.065 | 5.091 | -3.036 |
| -1.759291886010407 | 1.02 | 5.063 | -2.918 |
| -1.753008700703227 | 0.976 | 5.033 | -2.8 |
| -1.746725515396048 | 0.933 | 5.003 | -2.684 |
| -1.740442330088868 | 0.89 | 4.971 | -2.569 |
| -1.734159144781688 | 0.848 | 4.939 | -2.455 |
| -1.727875959474509 | 0.807 | 4.906 | -2.342 |
| -1.72159277416733 | 0.767 | 4.872 | -2.23 |
| -1.715309588860149 | 0.727 | 4.838 | -2.12 |
| -1.70902640355297 | 0.688 | 4.802 | -2.011 |
| -1.70274321824579 | 0.65 | 4.766 | -1.904 |
| -1.69646003293861 | 0.612 | 4.729 | -1.797 |
| -1.690176847631431 | 0.575 | 4.691 | -1.692 |
| -1.683893662324251 | 0.539 | 4.653 | -1.589 |
| -1.677610477017072 | 0.503 | 4.614 | -1.487 |
| -1.671327291709892 | 0.469 | 4.575 | -1.387 |
| -1.665044106402712 | 0.434 | 4.534 | -1.288 |
| -1.658760921095533 | 0.401 | 4.494 | -1.19 |
| -1.652477735788353 | 0.368 | 4.452 | -1.095 |
| -1.646194550481173 | 0.336 | 4.41 | -1 |
| -1.639911365173994 | 0.305 | 4.368 | -0.908 |
| -1.633628179866814 | 0.274 | 4.325 | -0.817 |
| -1.627344994559634 | 0.244 | 4.282 | -0.728 |
| -1.621061809252455 | 0.214 | 4.238 | -0.64 |
| -1.614778623945275 | 0.185 | 4.194 | -0.554 |
| -1.608495438638096 | 0.157 | 4.15 | -0.47 |
| -1.602212253330916 | 0.129 | 4.105 | -0.387 |
| -1.595929068023736 | 0.102 | 4.06 | -0.306 |
| -1.589645882716557 | 0.076 | 4.014 | -0.227 |
| -1.583362697409377 | 0.05 | 3.968 | -0.15 |
| -1.577079512102197 | 0.025 | 3.922 | -0.074 |
| -1.570796326795018 | 0 | 3.876 | 0 |
| -1.564513141487838 | -0.024 | 3.829 | 0.072 |
| -1.558229956180659 | -0.048 | 3.782 | 0.143 |
| -1.551946770873479 | -0.07 | 3.735 | 0.211 |
| -1.545663585566299 | -0.093 | 3.688 | 0.278 |
| -1.53938040025912 | -0.115 | 3.641 | 0.343 |
| -1.53309721495194 | -0.136 | 3.593 | 0.407 |
| -1.52681402964476 | -0.156 | 3.545 | 0.468 |
| -1.520530844337581 | -0.177 | 3.498 | 0.528 |
| -1.514247659030401 | -0.196 | 3.45 | 0.586 |
| -1.507964473723221 | -0.215 | 3.402 | 0.643 |
| -1.501681288416042 | -0.234 | 3.354 | 0.697 |
| -1.495398103108862 | -0.252 | 3.306 | 0.75 |
| -1.489114917801682 | -0.269 | 3.258 | 0.801 |
| -1.482831732494503 | -0.286 | 3.21 | 0.85 |
| -1.476548547187323 | -0.303 | 3.162 | 0.898 |
| -1.470265361880144 | -0.319 | 3.114 | 0.944 |
| -1.463982176572964 | -0.335 | 3.066 | 0.988 |
| -1.457698991265784 | -0.35 | 3.019 | 1.031 |
| -1.451415805958605 | -0.364 | 2.971 | 1.072 |
| -1.445132620651425 | -0.378 | 2.923 | 1.111 |
| -1.438849435344245 | -0.392 | 2.876 | 1.149 |
| -1.432566250037066 | -0.405 | 2.828 | 1.185 |
| -1.426283064729886 | -0.418 | 2.781 | 1.219 |
| -1.419999879422706 | -0.43 | 2.734 | 1.252 |
| -1.413716694115527 | -0.442 | 2.687 | 1.283 |
| -1.407433508808347 | -0.453 | 2.64 | 1.312 |
| -1.401150323501168 | -0.464 | 2.594 | 1.34 |
| -1.394867138193988 | -0.475 | 2.548 | 1.367 |
| -1.388583952886808 | -0.485 | 2.502 | 1.392 |
| -1.382300767579629 | -0.495 | 2.456 | 1.415 |
| -1.376017582272449 | -0.504 | 2.41 | 1.437 |
| -1.369734396965269 | -0.513 | 2.365 | 1.458 |
| -1.36345121165809 | -0.522 | 2.32 | 1.477 |
| -1.35716802635091 | -0.53 | 2.275 | 1.495 |
| -1.35088484104373 | -0.538 | 2.231 | 1.511 |
| -1.344601655736551 | -0.545 | 2.186 | 1.526 |
| -1.338318470429371 | -0.552 | 2.143 | 1.54 |
| -1.332035285122191 | -0.559 | 2.099 | 1.552 |
| -1.325752099815012 | -0.565 | 2.056 | 1.563 |
| -1.319468914507832 | -0.571 | 2.013 | 1.573 |
| -1.313185729200653 | -0.577 | 1.971 | 1.581 |
| -1.306902543893473 | -0.582 | 1.928 | 1.588 |
| -1.300619358586293 | -0.587 | 1.887 | 1.594 |
| -1.294336173279114 | -0.592 | 1.845 | 1.599 |
| -1.288052987971934 | -0.596 | 1.804 | 1.603 |
| -1.281769802664754 | -0.6 | 1.764 | 1.606 |
| -1.275486617357575 | -0.604 | 1.724 | 1.607 |
| -1.269203432050395 | -0.607 | 1.684 | 1.608 |
| -1.262920246743215 | -0.61 | 1.644 | 1.607 |
| -1.256637061436036 | -0.613 | 1.605 | 1.605 |
| -1.250353876128856 | -0.616 | 1.567 | 1.603 |
| -1.244070690821677 | -0.618 | 1.529 | 1.599 |
| -1.237787505514497 | -0.62 | 1.491 | 1.595 |
| -1.231504320207317 | -0.622 | 1.454 | 1.589 |
| -1.225221134900138 | -0.623 | 1.417 | 1.583 |
| -1.218937949592958 | -0.624 | 1.381 | 1.576 |
| -1.212654764285778 | -0.625 | 1.345 | 1.568 |
| -1.206371578978599 | -0.626 | 1.31 | 1.559 |
| -1.20008839367142 | -0.626 | 1.275 | 1.55 |
| -1.193805208364239 | -0.626 | 1.24 | 1.539 |
| -1.18752202305706 | -0.626 | 1.206 | 1.528 |
| -1.18123883774988 | -0.626 | 1.173 | 1.517 |
| -1.1749556524427 | -0.625 | 1.14 | 1.504 |
| -1.168672467135521 | -0.625 | 1.107 | 1.491 |
| -1.162389281828341 | -0.624 | 1.075 | 1.478 |
| -1.156106096521162 | -0.623 | 1.044 | 1.463 |
| -1.149822911213982 | -0.621 | 1.012 | 1.449 |
| -1.143539725906802 | -0.62 | 0.982 | 1.433 |
| -1.137256540599623 | -0.618 | 0.952 | 1.418 |
| -1.130973355292443 | -0.616 | 0.922 | 1.401 |
| -1.124690169985263 | -0.614 | 0.893 | 1.384 |
| -1.118406984678084 | -0.611 | 0.864 | 1.367 |
| -1.112123799370904 | -0.609 | 0.836 | 1.349 |
| -1.105840614063724 | -0.606 | 0.809 | 1.331 |
| -1.099557428756545 | -0.604 | 0.781 | 1.313 |
| -1.093274243449365 | -0.601 | 0.755 | 1.294 |
| -1.086991058142186 | -0.597 | 0.729 | 1.275 |
| -1.080707872835006 | -0.594 | 0.703 | 1.256 |
| -1.074424687527826 | -0.591 | 0.678 | 1.236 |
| -1.068141502220647 | -0.587 | 0.653 | 1.216 |
| -1.061858316913467 | -0.583 | 0.629 | 1.196 |
| -1.055575131606287 | -0.58 | 0.605 | 1.176 |
| -1.049291946299108 | -0.576 | 0.582 | 1.155 |
| -1.043008760991928 | -0.571 | 0.559 | 1.135 |
| -1.036725575684748 | -0.567 | 0.537 | 1.114 |
| -1.030442390377569 | -0.563 | 0.515 | 1.093 |
| -1.024159205070389 | -0.558 | 0.494 | 1.072 |
| -1.01787601976321 | -0.554 | 0.473 | 1.051 |
| -1.01159283445603 | -0.549 | 0.452 | 1.029 |
| -1.00530964914885 | -0.544 | 0.433 | 1.008 |
| -0.999026463841671 | -0.54 | 0.413 | 0.987 |
| -0.992743278534491 | -0.535 | 0.394 | 0.965 |
| -0.986460093227311 | -0.53 | 0.376 | 0.944 |
| -0.980176907920132 | -0.524 | 0.358 | 0.923 |
| -0.973893722612952 | -0.519 | 0.34 | 0.901 |
| -0.967610537305772 | -0.514 | 0.323 | 0.88 |
| -0.961327351998593 | -0.509 | 0.306 | 0.859 |
| -0.955044166691413 | -0.503 | 0.29 | 0.838 |
| -0.948760981384233 | -0.498 | 0.274 | 0.817 |
| -0.942477796077054 | -0.492 | 0.259 | 0.796 |
| -0.936194610769874 | -0.486 | 0.244 | 0.775 |
| -0.929911425462695 | -0.481 | 0.229 | 0.755 |
| -0.923628240155515 | -0.475 | 0.215 | 0.734 |
| -0.917345054848335 | -0.469 | 0.201 | 0.714 |
| -0.911061869541156 | -0.463 | 0.188 | 0.694 |
| -0.904778684233976 | -0.458 | 0.175 | 0.674 |
| -0.898495498926796 | -0.452 | 0.163 | 0.654 |
| -0.892212313619617 | -0.446 | 0.151 | 0.635 |
| -0.885929128312437 | -0.44 | 0.139 | 0.616 |
| -0.879645943005257 | -0.434 | 0.128 | 0.596 |
| -0.873362757698078 | -0.428 | 0.117 | 0.578 |
| -0.867079572390898 | -0.422 | 0.106 | 0.559 |
| -0.860796387083718 | -0.416 | 0.096 | 0.541 |
| -0.854513201776539 | -0.41 | 0.086 | 0.523 |
| -0.848230016469359 | -0.404 | 0.076 | 0.505 |
| -0.84194683116218 | -0.397 | 0.067 | 0.487 |
| -0.835663645855 | -0.391 | 0.059 | 0.47 |
| -0.82938046054782 | -0.385 | 0.05 | 0.453 |
| -0.823097275240641 | -0.379 | 0.042 | 0.436 |
| -0.816814089933461 | -0.373 | 0.034 | 0.42 |
| -0.810530904626281 | -0.367 | 0.027 | 0.404 |
| -0.804247719319102 | -0.361 | 0.02 | 0.388 |
| -0.797964534011922 | -0.355 | 0.013 | 0.373 |
| -0.791681348704742 | -0.349 | 0.006 | 0.357 |
| -0.785398163397563 | -0.343 | 0 | 0.343 |
| -0.779114978090383 | -0.337 | -0.006 | 0.328 |
| -0.772831792783204 | -0.33 | -0.012 | 0.314 |
| -0.766548607476024 | -0.324 | -0.017 | 0.3 |
| -0.760265422168844 | -0.318 | -0.022 | 0.286 |
| -0.753982236861665 | -0.312 | -0.027 | 0.273 |
| -0.747699051554485 | -0.307 | -0.031 | 0.26 |
| -0.741415866247305 | -0.301 | -0.036 | 0.248 |
| -0.735132680940126 | -0.295 | -0.04 | 0.236 |
| -0.728849495632946 | -0.289 | -0.044 | 0.224 |
| -0.722566310325766 | -0.283 | -0.047 | 0.212 |
| -0.716283125018587 | -0.277 | -0.051 | 0.201 |
| -0.709999939711407 | -0.271 | -0.054 | 0.19 |
| -0.703716754404227 | -0.266 | -0.057 | 0.179 |
| -0.697433569097048 | -0.26 | -0.059 | 0.169 |
| -0.691150383789868 | -0.254 | -0.062 | 0.159 |
| -0.684867198482689 | -0.249 | -0.064 | 0.149 |
| -0.678584013175509 | -0.243 | -0.066 | 0.14 |
| -0.672300827868329 | -0.238 | -0.068 | 0.131 |
| -0.66601764256115 | -0.232 | -0.07 | 0.122 |
| -0.65973445725397 | -0.227 | -0.071 | 0.114 |
| -0.65345127194679 | -0.222 | -0.073 | 0.106 |
| -0.647168086639611 | -0.216 | -0.074 | 0.098 |
| -0.640884901332431 | -0.211 | -0.075 | 0.091 |
| -0.634601716025251 | -0.206 | -0.076 | 0.084 |
| -0.628318530718072 | -0.201 | -0.077 | 0.077 |
| -0.622035345410892 | -0.196 | -0.077 | 0.07 |
| -0.615752160103712 | -0.191 | -0.078 | 0.064 |
| -0.609468974796533 | -0.186 | -0.078 | 0.058 |
| -0.603185789489353 | -0.181 | -0.078 | 0.052 |
| -0.596902604182174 | -0.176 | -0.078 | 0.046 |
| -0.590619418874994 | -0.171 | -0.078 | 0.041 |
| -0.584336233567814 | -0.166 | -0.078 | 0.036 |
| -0.578053048260635 | -0.162 | -0.078 | 0.031 |
| -0.571769862953455 | -0.157 | -0.077 | 0.027 |
| -0.565486677646275 | -0.153 | -0.077 | 0.023 |
| -0.559203492339096 | -0.148 | -0.076 | 0.019 |
| -0.552920307031916 | -0.144 | -0.076 | 0.015 |
| -0.546637121724737 | -0.14 | -0.075 | 0.011 |
| -0.540353936417557 | -0.135 | -0.074 | 0.008 |
| -0.534070751110377 | -0.131 | -0.073 | 0.005 |
| -0.527787565803198 | -0.127 | -0.072 | 0.002 |
| -0.521504380496018 | -0.123 | -0.071 | -0.001 |
| -0.515221195188838 | -0.119 | -0.07 | -0.003 |
| -0.508938009881659 | -0.115 | -0.069 | -0.006 |
| -0.502654824574479 | -0.111 | -0.068 | -0.008 |
| -0.496371639267299 | -0.108 | -0.067 | -0.01 |
| -0.49008845396012 | -0.104 | -0.066 | -0.012 |
| -0.48380526865294 | -0.1 | -0.064 | -0.013 |
| -0.477522083345761 | -0.097 | -0.063 | -0.015 |
| -0.471238898038581 | -0.093 | -0.062 | -0.016 |
| -0.464955712731402 | -0.09 | -0.06 | -0.018 |
| -0.458672527424222 | -0.087 | -0.059 | -0.019 |
| -0.452389342117042 | -0.083 | -0.057 | -0.02 |
| -0.446106156809863 | -0.08 | -0.056 | -0.02 |
| -0.439822971502683 | -0.077 | -0.054 | -0.021 |
| -0.433539786195504 | -0.074 | -0.053 | -0.022 |
| -0.427256600888324 | -0.071 | -0.051 | -0.022 |
| -0.420973415581144 | -0.068 | -0.05 | -0.023 |
| -0.414690230273965 | -0.065 | -0.048 | -0.023 |
| -0.408407044966785 | -0.063 | -0.047 | -0.023 |
| -0.402123859659606 | -0.06 | -0.045 | -0.023 |
| -0.395840674352426 | -0.057 | -0.044 | -0.023 |
| -0.389557489045247 | -0.055 | -0.042 | -0.023 |
| -0.383274303738067 | -0.052 | -0.041 | -0.023 |
| -0.376991118430887 | -0.05 | -0.039 | -0.023 |
| -0.370707933123708 | -0.047 | -0.038 | -0.023 |
| -0.364424747816528 | -0.045 | -0.036 | -0.022 |
| -0.358141562509349 | -0.043 | -0.035 | -0.022 |
| -0.351858377202169 | -0.041 | -0.033 | -0.021 |
| -0.345575191894989 | -0.039 | -0.032 | -0.021 |
| -0.33929200658781 | -0.037 | -0.03 | -0.021 |
| -0.33300882128063 | -0.035 | -0.029 | -0.02 |
| -0.326725635973451 | -0.033 | -0.028 | -0.019 |
| -0.320442450666271 | -0.031 | -0.026 | -0.019 |
| -0.314159265359092 | -0.029 | -0.025 | -0.018 |
| -0.307876080051912 | -0.028 | -0.024 | -0.018 |
| -0.301592894744732 | -0.026 | -0.023 | -0.017 |
| -0.295309709437553 | -0.025 | -0.021 | -0.016 |
| -0.289026524130373 | -0.023 | -0.02 | -0.016 |
| -0.282743338823194 | -0.022 | -0.019 | -0.015 |
| -0.276460153516014 | -0.02 | -0.018 | -0.014 |
| -0.270176968208834 | -0.019 | -0.017 | -0.014 |
| -0.263893782901655 | -0.018 | -0.016 | -0.013 |
| -0.257610597594475 | -0.017 | -0.015 | -0.012 |
| -0.251327412287296 | -0.015 | -0.014 | -0.012 |
| -0.245044226980116 | -0.014 | -0.013 | -0.011 |
| -0.238761041672937 | -0.013 | -0.012 | -0.01 |
| -0.232477856365757 | -0.012 | -0.011 | -0.01 |
| -0.226194671058577 | -0.011 | -0.01 | -0.009 |
| -0.219911485751398 | -0.01 | -0.01 | -0.008 |
| -0.213628300444218 | -0.01 | -0.009 | -0.008 |
| -0.207345115137039 | -0.009 | -0.008 | -0.007 |
| -0.201061929829859 | -0.008 | -0.007 | -0.007 |
| -0.194778744522679 | -0.007 | -0.007 | -0.006 |
| -0.1884955592155 | -0.007 | -0.006 | -0.006 |
| -0.18221237390832 | -0.006 | -0.006 | -0.005 |
| -0.175929188601141 | -0.005 | -0.005 | -0.005 |
| -0.169646003293961 | -0.005 | -0.005 | -0.004 |
| -0.163362817986782 | -0.004 | -0.004 | -0.004 |
| -0.157079632679602 | -0.004 | -0.004 | -0.003 |
| -0.150796447372422 | -0.003 | -0.003 | -0.003 |
| -0.144513262065243 | -0.003 | -0.003 | -0.003 |
| -0.138230076758063 | -0.003 | -0.003 | -0.002 |
| -0.131946891450884 | -0.002 | -0.002 | -0.002 |
| -0.125663706143704 | -0.002 | -0.002 | -0.002 |
| -0.119380520836524 | -0.002 | -0.002 | -0.002 |
| -0.113097335529345 | -0.001 | -0.001 | -0.001 |
| -0.106814150222165 | -0.001 | -0.001 | -0.001 |
| -0.100530964914986 | -0.001 | -0.001 | -0.001 |
| -0.0942477796078061 | -0.001 | -0.001 | -0.001 |
| -0.0879645943006265 | -0.001 | -0.001 | -0.001 |
| -0.0816814089934469 | -0.001 | -0.001 | -0.001 |
| -0.0753982236862674 | 0 | 0 | 0 |
| -0.0691150383790878 | 0 | 0 | 0 |
| -0.0628318530719082 | 0 | 0 | 0 |
| -0.0565486677647286 | 0 | 0 | 0 |
| -0.050265482457549 | 0 | 0 | 0 |
| -0.0439822971503694 | 0 | 0 | 0 |
| -0.0376991118431899 | 0 | 0 | 0 |
| -0.0314159265360103 | 0 | 0 | 0 |
| -0.0251327412288307 | 0 | 0 | 0 |
| -0.0188495559216511 | 0 | 0 | 0 |
| -0.0125663706144715 | 0 | 0 | 0 |
| -0.00628318530729192 | 0 | 0 | 0 |
| -1.12338957580782e-13 | 0 | 0 | 0 |
| 0.00628318530706725 | 0 | 0 | 0 |
| 0.0125663706142468 | 0 | 0 | 0 |
| 0.0188495559214264 | 0 | 0 | 0 |
| 0.025132741228606 | 0 | 0 | 0 |
| 0.0314159265357856 | 0 | 0 | 0 |
| 0.0376991118429652 | 0 | 0 | 0 |
| 0.0439822971501448 | 0 | 0 | 0 |
| 0.0502654824573243 | 0 | 0 | 0 |
| 0.0565486677645039 | 0 | 0 | 0 |
| 0.0628318530716835 | 0 | 0 | 0 |
| 0.0691150383788631 | 0 | 0 | 0 |
| 0.0753982236860427 | 0 | 0 | 0 |
| 0.0816814089932222 | 0.001 | 0.001 | 0.001 |
| 0.0879645943004018 | 0.001 | 0.001 | 0.001 |
| 0.0942477796075814 | 0.001 | 0.001 | 0.001 |
| 0.100530964914761 | 0.001 | 0.001 | 0.001 |
| 0.106814150221941 | 0.001 | 0.001 | 0.001 |
| 0.11309733552912 | 0.001 | 0.001 | 0.001 |
| 0.1193805208363 | 0.002 | 0.002 | 0.002 |
| 0.125663706143479 | 0.002 | 0.002 | 0.002 |
| 0.131946891450659 | 0.002 | 0.002 | 0.002 |
| 0.138230076757839 | 0.003 | 0.003 | 0.002 |
| 0.144513262065018 | 0.003 | 0.003 | 0.003 |
| 0.150796447372198 | 0.003 | 0.003 | 0.003 |
| 0.157079632679377 | 0.004 | 0.004 | 0.003 |
| 0.163362817986557 | 0.004 | 0.004 | 0.004 |
| 0.169646003293736 | 0.005 | 0.005 | 0.004 |
| 0.175929188600916 | 0.005 | 0.005 | 0.005 |
| 0.182212373908096 | 0.006 | 0.006 | 0.005 |
| 0.188495559215275 | 0.007 | 0.006 | 0.006 |
| 0.194778744522455 | 0.007 | 0.007 | 0.006 |
| 0.201061929829634 | 0.008 | 0.007 | 0.007 |
| 0.207345115136814 | 0.009 | 0.008 | 0.007 |
| 0.213628300443994 | 0.01 | 0.009 | 0.008 |
| 0.219911485751173 | 0.01 | 0.01 | 0.008 |
| 0.226194671058353 | 0.011 | 0.01 | 0.009 |
| 0.232477856365532 | 0.012 | 0.011 | 0.01 |
| 0.238761041672712 | 0.013 | 0.012 | 0.01 |
| 0.245044226979891 | 0.014 | 0.013 | 0.011 |
| 0.251327412287071 | 0.015 | 0.014 | 0.012 |
| 0.257610597594251 | 0.017 | 0.015 | 0.012 |
| 0.26389378290143 | 0.018 | 0.016 | 0.013 |
| 0.27017696820861 | 0.019 | 0.017 | 0.014 |
| 0.276460153515789 | 0.02 | 0.018 | 0.014 |
| 0.282743338822969 | 0.022 | 0.019 | 0.015 |
| 0.289026524130149 | 0.023 | 0.02 | 0.016 |
| 0.295309709437328 | 0.025 | 0.021 | 0.016 |
| 0.301592894744508 | 0.026 | 0.023 | 0.017 |
| 0.307876080051687 | 0.028 | 0.024 | 0.018 |
| 0.314159265358867 | 0.029 | 0.025 | 0.018 |
| 0.320442450666046 | 0.031 | 0.026 | 0.019 |
| 0.326725635973226 | 0.033 | 0.028 | 0.019 |
| 0.333008821280406 | 0.035 | 0.029 | 0.02 |
| 0.339292006587585 | 0.037 | 0.03 | 0.021 |
| 0.345575191894765 | 0.039 | 0.032 | 0.021 |
| 0.351858377201944 | 0.041 | 0.033 | 0.021 |
| 0.358141562509124 | 0.043 | 0.035 | 0.022 |
| 0.364424747816304 | 0.045 | 0.036 | 0.022 |
| 0.370707933123483 | 0.047 | 0.038 | 0.023 |
| 0.376991118430663 | 0.05 | 0.039 | 0.023 |
| 0.383274303737842 | 0.052 | 0.041 | 0.023 |
| 0.389557489045022 | 0.055 | 0.042 | 0.023 |
| 0.395840674352201 | 0.057 | 0.044 | 0.023 |
| 0.402123859659381 | 0.06 | 0.045 | 0.023 |
| 0.408407044966561 | 0.063 | 0.047 | 0.023 |
| 0.41469023027374 | 0.065 | 0.048 | 0.023 |
| 0.42097341558092 | 0.068 | 0.05 | 0.023 |
| 0.427256600888099 | 0.071 | 0.051 | 0.022 |
| 0.433539786195279 | 0.074 | 0.053 | 0.022 |
| 0.439822971502459 | 0.077 | 0.054 | 0.021 |
| 0.446106156809638 | 0.08 | 0.056 | 0.02 |
| 0.452389342116818 | 0.083 | 0.057 | 0.02 |
| 0.458672527423997 | 0.087 | 0.059 | 0.019 |
| 0.464955712731177 | 0.09 | 0.06 | 0.018 |
| 0.471238898038356 | 0.093 | 0.062 | 0.016 |
| 0.477522083345536 | 0.097 | 0.063 | 0.015 |
| 0.483805268652716 | 0.1 | 0.064 | 0.013 |
| 0.490088453959895 | 0.104 | 0.066 | 0.012 |
| 0.496371639267075 | 0.108 | 0.067 | 0.01 |
| 0.502654824574254 | 0.111 | 0.068 | 0.008 |
| 0.508938009881434 | 0.115 | 0.069 | 0.006 |
| 0.515221195188614 | 0.119 | 0.07 | 0.003 |
| 0.521504380495793 | 0.123 | 0.071 | 0.001 |
| 0.527787565802973 | 0.127 | 0.072 | -0.002 |
| 0.534070751110153 | 0.131 | 0.073 | -0.005 |
| 0.540353936417332 | 0.135 | 0.074 | -0.008 |
| 0.546637121724512 | 0.14 | 0.075 | -0.011 |
| 0.552920307031692 | 0.144 | 0.076 | -0.015 |
| 0.559203492338871 | 0.148 | 0.076 | -0.019 |
| 0.565486677646051 | 0.153 | 0.077 | -0.023 |
| 0.571769862953231 | 0.157 | 0.077 | -0.027 |
| 0.57805304826041 | 0.162 | 0.078 | -0.031 |
| 0.58433623356759 | 0.166 | 0.078 | -0.036 |
| 0.590619418874769 | 0.171 | 0.078 | -0.041 |
| 0.596902604181949 | 0.176 | 0.078 | -0.046 |
| 0.603185789489129 | 0.181 | 0.078 | -0.052 |
| 0.609468974796308 | 0.186 | 0.078 | -0.058 |
| 0.615752160103488 | 0.191 | 0.078 | -0.064 |
| 0.622035345410668 | 0.196 | 0.077 | -0.07 |
| 0.628318530717847 | 0.201 | 0.077 | -0.077 |
| 0.634601716025027 | 0.206 | 0.076 | -0.084 |
| 0.640884901332206 | 0.211 | 0.075 | -0.091 |
| 0.647168086639386 | 0.216 | 0.074 | -0.098 |
| 0.653451271946566 | 0.222 | 0.073 | -0.106 |
| 0.659734457253745 | 0.227 | 0.071 | -0.114 |
| 0.666017642560925 | 0.232 | 0.07 | -0.122 |
| 0.672300827868105 | 0.238 | 0.068 | -0.131 |
| 0.678584013175284 | 0.243 | 0.066 | -0.14 |
| 0.684867198482464 | 0.249 | 0.064 | -0.149 |
| 0.691150383789644 | 0.254 | 0.062 | -0.159 |
| 0.697433569096823 | 0.26 | 0.059 | -0.169 |
| 0.703716754404003 | 0.266 | 0.057 | -0.179 |
| 0.709999939711183 | 0.271 | 0.054 | -0.19 |
| 0.716283125018362 | 0.277 | 0.051 | -0.201 |
| 0.722566310325542 | 0.283 | 0.047 | -0.212 |
| 0.728849495632721 | 0.289 | 0.044 | -0.224 |
| 0.735132680939901 | 0.295 | 0.04 | -0.236 |
| 0.741415866247081 | 0.301 | 0.036 | -0.248 |
| 0.74769905155426 | 0.307 | 0.031 | -0.26 |
| 0.75398223686144 | 0.312 | 0.027 | -0.273 |
| 0.76026542216862 | 0.318 | 0.022 | -0.286 |
| 0.766548607475799 | 0.324 | 0.017 | -0.3 |
| 0.772831792782979 | 0.33 | 0.012 | -0.314 |
| 0.779114978090159 | 0.337 | 0.006 | -0.328 |
| 0.785398163397338 | 0.343 | 0 | -0.343 |
| 0.791681348704518 | 0.349 | -0.006 | -0.357 |
| 0.797964534011697 | 0.355 | -0.013 | -0.373 |
| 0.804247719318877 | 0.361 | -0.02 | -0.388 |
| 0.810530904626057 | 0.367 | -0.027 | -0.404 |
| 0.816814089933236 | 0.373 | -0.034 | -0.42 |
| 0.823097275240416 | 0.379 | -0.042 | -0.436 |
| 0.829380460547596 | 0.385 | -0.05 | -0.453 |
| 0.835663645854775 | 0.391 | -0.059 | -0.47 |
| 0.841946831161955 | 0.397 | -0.067 | -0.487 |
| 0.848230016469135 | 0.404 | -0.076 | -0.505 |
| 0.854513201776314 | 0.41 | -0.086 | -0.523 |
| 0.860796387083494 | 0.416 | -0.096 | -0.541 |
| 0.867079572390674 | 0.422 | -0.106 | -0.559 |
| 0.873362757697853 | 0.428 | -0.117 | -0.578 |
| 0.879645943005033 | 0.434 | -0.128 | -0.596 |
| 0.885929128312212 | 0.44 | -0.139 | -0.616 |
| 0.892212313619392 | 0.446 | -0.151 | -0.635 |
| 0.898495498926572 | 0.452 | -0.163 | -0.654 |
| 0.904778684233751 | 0.458 | -0.175 | -0.674 |
| 0.911061869540931 | 0.463 | -0.188 | -0.694 |
| 0.917345054848111 | 0.469 | -0.201 | -0.714 |
| 0.92362824015529 | 0.475 | -0.215 | -0.734 |
| 0.92991142546247 | 0.481 | -0.229 | -0.755 |
| 0.93619461076965 | 0.486 | -0.244 | -0.775 |
| 0.942477796076829 | 0.492 | -0.259 | -0.796 |
| 0.948760981384009 | 0.498 | -0.274 | -0.817 |
| 0.955044166691188 | 0.503 | -0.29 | -0.838 |
| 0.961327351998368 | 0.509 | -0.306 | -0.859 |
| 0.967610537305548 | 0.514 | -0.323 | -0.88 |
| 0.973893722612727 | 0.519 | -0.34 | -0.901 |
| 0.980176907919907 | 0.524 | -0.358 | -0.923 |
| 0.986460093227087 | 0.53 | -0.376 | -0.944 |
| 0.992743278534266 | 0.535 | -0.394 | -0.965 |
| 0.999026463841446 | 0.54 | -0.413 | -0.987 |
| 1.005309649148626 | 0.544 | -0.433 | -1.008 |
| 1.011592834455805 | 0.549 | -0.452 | -1.029 |
| 1.017876019762985 | 0.554 | -0.473 | -1.051 |
| 1.024159205070164 | 0.558 | -0.494 | -1.072 |
| 1.030442390377344 | 0.563 | -0.515 | -1.093 |
| 1.036725575684524 | 0.567 | -0.537 | -1.114 |
| 1.043008760991703 | 0.571 | -0.559 | -1.135 |
| 1.049291946298883 | 0.576 | -0.582 | -1.155 |
| 1.055575131606063 | 0.58 | -0.605 | -1.176 |
| 1.061858316913242 | 0.583 | -0.629 | -1.196 |
| 1.068141502220422 | 0.587 | -0.653 | -1.216 |
| 1.074424687527602 | 0.591 | -0.678 | -1.236 |
| 1.080707872834781 | 0.594 | -0.703 | -1.256 |
| 1.086991058141961 | 0.597 | -0.729 | -1.275 |
| 1.09327424344914 | 0.601 | -0.755 | -1.294 |
| 1.09955742875632 | 0.604 | -0.781 | -1.313 |
| 1.1058406140635 | 0.606 | -0.809 | -1.331 |
| 1.112123799370679 | 0.609 | -0.836 | -1.349 |
| 1.11840698467786 | 0.611 | -0.864 | -1.367 |
| 1.124690169985039 | 0.614 | -0.893 | -1.384 |
| 1.130973355292218 | 0.616 | -0.922 | -1.401 |
| 1.137256540599398 | 0.618 | -0.952 | -1.418 |
| 1.143539725906578 | 0.62 | -0.982 | -1.433 |
| 1.149822911213757 | 0.621 | -1.012 | -1.449 |
| 1.156106096520937 | 0.623 | -1.044 | -1.463 |
| 1.162389281828116 | 0.624 | -1.075 | -1.478 |
| 1.168672467135296 | 0.625 | -1.107 | -1.491 |
| 1.174955652442476 | 0.625 | -1.14 | -1.504 |
| 1.181238837749655 | 0.626 | -1.173 | -1.517 |
| 1.187522023056835 | 0.626 | -1.206 | -1.528 |
| 1.193805208364015 | 0.626 | -1.24 | -1.539 |
| 1.200088393671194 | 0.626 | -1.275 | -1.55 |
| 1.206371578978374 | 0.626 | -1.31 | -1.559 |
| 1.212654764285554 | 0.625 | -1.345 | -1.568 |
| 1.218937949592733 | 0.624 | -1.381 | -1.576 |
| 1.225221134899913 | 0.623 | -1.417 | -1.583 |
| 1.231504320207093 | 0.622 | -1.454 | -1.589 |
| 1.237787505514272 | 0.62 | -1.491 | -1.595 |
| 1.244070690821452 | 0.618 | -1.529 | -1.599 |
| 1.250353876128631 | 0.616 | -1.567 | -1.603 |
| 1.256637061435811 | 0.613 | -1.605 | -1.605 |
| 1.262920246742991 | 0.61 | -1.644 | -1.607 |
| 1.26920343205017 | 0.607 | -1.684 | -1.608 |
| 1.27548661735735 | 0.604 | -1.724 | -1.607 |
| 1.28176980266453 | 0.6 | -1.764 | -1.606 |
| 1.28805298797171 | 0.596 | -1.804 | -1.603 |
| 1.294336173278889 | 0.592 | -1.845 | -1.599 |
| 1.300619358586069 | 0.587 | -1.887 | -1.594 |
| 1.306902543893248 | 0.582 | -1.928 | -1.588 |
| 1.313185729200428 | 0.577 | -1.971 | -1.581 |
| 1.319468914507607 | 0.571 | -2.013 | -1.573 |
| 1.325752099814787 | 0.565 | -2.056 | -1.563 |
| 1.332035285121967 | 0.559 | -2.099 | -1.552 |
| 1.338318470429146 | 0.552 | -2.143 | -1.54 |
| 1.344601655736326 | 0.545 | -2.186 | -1.526 |
| 1.350884841043506 | 0.538 | -2.231 | -1.511 |
| 1.357168026350685 | 0.53 | -2.275 | -1.495 |
| 1.363451211657865 | 0.522 | -2.32 | -1.477 |
| 1.369734396965045 | 0.513 | -2.365 | -1.458 |
| 1.376017582272224 | 0.504 | -2.41 | -1.437 |
| 1.382300767579404 | 0.495 | -2.456 | -1.415 |
| 1.388583952886583 | 0.485 | -2.502 | -1.392 |
| 1.394867138193763 | 0.475 | -2.548 | -1.367 |
| 1.401150323500943 | 0.464 | -2.594 | -1.34 |
| 1.407433508808122 | 0.453 | -2.64 | -1.312 |
| 1.413716694115302 | 0.442 | -2.687 | -1.283 |
| 1.419999879422482 | 0.43 | -2.734 | -1.252 |
| 1.426283064729661 | 0.418 | -2.781 | -1.219 |
| 1.432566250036841 | 0.405 | -2.828 | -1.185 |
| 1.438849435344021 | 0.392 | -2.876 | -1.149 |
| 1.4451326206512 | 0.378 | -2.923 | -1.111 |
| 1.45141580595838 | 0.364 | -2.971 | -1.072 |
| 1.45769899126556 | 0.35 | -3.019 | -1.031 |
| 1.46398217657274 | 0.335 | -3.066 | -0.988 |
| 1.470265361879919 | 0.319 | -3.114 | -0.944 |
| 1.476548547187098 | 0.303 | -3.162 | -0.898 |
| 1.482831732494278 | 0.286 | -3.21 | -0.85 |
| 1.489114917801458 | 0.269 | -3.258 | -0.801 |
| 1.495398103108637 | 0.252 | -3.306 | -0.75 |
| 1.501681288415817 | 0.234 | -3.354 | -0.697 |
| 1.507964473722997 | 0.215 | -3.402 | -0.643 |
| 1.514247659030176 | 0.196 | -3.45 | -0.586 |
| 1.520530844337356 | 0.177 | -3.498 | -0.528 |
| 1.526814029644536 | 0.156 | -3.545 | -0.468 |
| 1.533097214951715 | 0.136 | -3.593 | -0.407 |
| 1.539380400258895 | 0.115 | -3.641 | -0.343 |
| 1.545663585566075 | 0.093 | -3.688 | -0.278 |
| 1.551946770873254 | 0.07 | -3.735 | -0.211 |
| 1.558229956180434 | 0.048 | -3.782 | -0.143 |
| 1.564513141487613 | 0.024 | -3.829 | -0.072 |
| 1.570796326794793 | 0 | -3.876 | 0 |
| 1.577079512101973 | -0.025 | -3.922 | 0.074 |
| 1.583362697409152 | -0.05 | -3.968 | 0.15 |
| 1.589645882716332 | -0.076 | -4.014 | 0.227 |
| 1.595929068023512 | -0.102 | -4.06 | 0.306 |
| 1.602212253330691 | -0.129 | -4.105 | 0.387 |
| 1.608495438637871 | -0.157 | -4.15 | 0.47 |
| 1.61477862394505 | -0.185 | -4.194 | 0.554 |
| 1.62106180925223 | -0.214 | -4.238 | 0.64 |
| 1.62734499455941 | -0.244 | -4.282 | 0.728 |
| 1.633628179866589 | -0.274 | -4.325 | 0.817 |
| 1.63991136517377 | -0.305 | -4.368 | 0.908 |
| 1.646194550480949 | -0.336 | -4.41 | 1 |
| 1.652477735788128 | -0.368 | -4.452 | 1.095 |
| 1.658760921095308 | -0.401 | -4.494 | 1.19 |
| 1.665044106402488 | -0.434 | -4.534 | 1.288 |
| 1.671327291709667 | -0.469 | -4.575 | 1.387 |
| 1.677610477016847 | -0.503 | -4.614 | 1.487 |
| 1.683893662324026 | -0.539 | -4.653 | 1.589 |
| 1.690176847631206 | -0.575 | -4.691 | 1.692 |
| 1.696460032938386 | -0.612 | -4.729 | 1.797 |
| 1.702743218245565 | -0.65 | -4.766 | 1.904 |
| 1.709026403552745 | -0.688 | -4.802 | 2.011 |
| 1.715309588859925 | -0.727 | -4.838 | 2.12 |
| 1.721592774167104 | -0.767 | -4.872 | 2.23 |
| 1.727875959474284 | -0.807 | -4.906 | 2.342 |
| 1.734159144781464 | -0.848 | -4.939 | 2.455 |
| 1.740442330088643 | -0.89 | -4.971 | 2.569 |
| 1.746725515395823 | -0.933 | -5.003 | 2.684 |
| 1.753008700703003 | -0.976 | -5.033 | 2.8 |
| 1.759291886010182 | -1.02 | -5.063 | 2.918 |
| 1.765575071317362 | -1.065 | -5.091 | 3.036 |
| 1.771858256624541 | -1.111 | -5.119 | 3.156 |
| 1.778141441931721 | -1.157 | -5.146 | 3.276 |
| 1.784424627238901 | -1.205 | -5.171 | 3.397 |
| 1.79070781254608 | -1.253 | -5.196 | 3.519 |
| 1.79699099785326 | -1.301 | -5.219 | 3.642 |
| 1.80327418316044 | -1.351 | -5.241 | 3.766 |
| 1.809557368467619 | -1.401 | -5.263 | 3.891 |
| 1.815840553774799 | -1.453 | -5.283 | 4.016 |
| 1.822123739081979 | -1.504 | -5.301 | 4.141 |
| 1.828406924389158 | -1.557 | -5.319 | 4.268 |
| 1.834690109696338 | -1.611 | -5.335 | 4.394 |
| 1.840973295003518 | -1.665 | -5.35 | 4.521 |
| 1.847256480310697 | -1.721 | -5.364 | 4.649 |
| 1.853539665617877 | -1.777 | -5.377 | 4.777 |
| 1.859822850925056 | -1.834 | -5.388 | 4.905 |
| 1.866106036232236 | -1.891 | -5.398 | 5.033 |
| 1.872389221539416 | -1.95 | -5.406 | 5.161 |
| 1.878672406846595 | -2.009 | -5.413 | 5.29 |
| 1.884955592153775 | -2.07 | -5.418 | 5.418 |
| 1.891238777460955 | -2.131 | -5.422 | 5.547 |
| 1.897521962768134 | -2.193 | -5.425 | 5.675 |
| 1.903805148075314 | -2.256 | -5.426 | 5.803 |
| 1.910088333382494 | -2.319 | -5.425 | 5.93 |
| 1.916371518689673 | -2.384 | -5.423 | 6.058 |
| 1.922654703996853 | -2.449 | -5.419 | 6.185 |
| 1.928937889304033 | -2.516 | -5.413 | 6.311 |
| 1.935221074611212 | -2.583 | -5.406 | 6.437 |
| 1.941504259918392 | -2.651 | -5.397 | 6.562 |
| 1.947787445225571 | -2.72 | -5.387 | 6.686 |
| 1.954070630532751 | -2.79 | -5.375 | 6.81 |
| 1.960353815839931 | -2.861 | -5.36 | 6.933 |
| 1.96663700114711 | -2.933 | -5.345 | 7.054 |
| 1.97292018645429 | -3.006 | -5.327 | 7.175 |
| 1.97920337176147 | -3.079 | -5.307 | 7.295 |
| 1.985486557068649 | -3.154 | -5.286 | 7.413 |
| 1.991769742375829 | -3.229 | -5.263 | 7.53 |
| 1.998052927683009 | -3.305 | -5.237 | 7.646 |
| 2.004336112990188 | -3.383 | -5.21 | 7.76 |
| 2.010619298297368 | -3.461 | -5.181 | 7.873 |
| 2.016902483604547 | -3.54 | -5.15 | 7.984 |
| 2.023185668911727 | -3.62 | -5.117 | 8.093 |
| 2.029468854218907 | -3.701 | -5.082 | 8.201 |
| 2.035752039526086 | -3.783 | -5.044 | 8.307 |
| 2.042035224833266 | -3.866 | -5.005 | 8.41 |
| 2.048318410140446 | -3.95 | -4.964 | 8.512 |
| 2.054601595447625 | -4.034 | -4.92 | 8.612 |
| 2.060884780754805 | -4.12 | -4.874 | 8.709 |
| 2.067167966061984 | -4.207 | -4.827 | 8.804 |
| 2.073451151369164 | -4.294 | -4.776 | 8.897 |
| 2.079734336676344 | -4.383 | -4.724 | 8.987 |
| 2.086017521983524 | -4.473 | -4.67 | 9.074 |
| 2.092300707290703 | -4.563 | -4.613 | 9.159 |
| 2.098583892597883 | -4.655 | -4.554 | 9.242 |
| 2.104867077905062 | -4.747 | -4.493 | 9.321 |
| 2.111150263212242 | -4.841 | -4.429 | 9.397 |
| 2.117433448519422 | -4.935 | -4.363 | 9.471 |
| 2.123716633826601 | -5.03 | -4.295 | 9.541 |
| 2.129999819133781 | -5.127 | -4.224 | 9.609 |
| 2.136283004440961 | -5.224 | -4.151 | 9.672 |
| 2.14256618974814 | -5.322 | -4.076 | 9.733 |
| 2.14884937505532 | -5.422 | -3.998 | 9.79 |
| 2.1551325603625 | -5.522 | -3.918 | 9.844 |
| 2.16141574566968 | -5.623 | -3.835 | 9.894 |
| 2.167698930976859 | -5.725 | -3.75 | 9.941 |
| 2.173982116284038 | -5.829 | -3.662 | 9.983 |
| 2.180265301591218 | -5.933 | -3.572 | 10.022 |
| 2.186548486898398 | -6.038 | -3.479 | 10.057 |
| 2.192831672205577 | -6.144 | -3.384 | 10.088 |
| 2.199114857512757 | -6.251 | -3.286 | 10.115 |
| 2.205398042819936 | -6.359 | -3.186 | 10.137 |
| 2.211681228127116 | -6.468 | -3.083 | 10.156 |
| 2.217964413434296 | -6.579 | -2.978 | 10.17 |
| 2.224247598741475 | -6.69 | -2.87 | 10.18 |
| 2.230530784048655 | -6.802 | -2.76 | 10.185 |
| 2.236813969355835 | -6.915 | -2.647 | 10.185 |
| 2.243097154663014 | -7.029 | -2.531 | 10.182 |
| 2.249380339970194 | -7.144 | -2.413 | 10.173 |
| 2.255663525277374 | -7.26 | -2.292 | 10.16 |
| 2.261946710584553 | -7.377 | -2.169 | 10.142 |
| 2.268229895891733 | -7.495 | -2.042 | 10.118 |
| 2.274513081198912 | -7.614 | -1.914 | 10.091 |
| 2.280796266506092 | -7.734 | -1.782 | 10.058 |
| 2.287079451813272 | -7.855 | -1.648 | 10.019 |
| 2.293362637120452 | -7.977 | -1.512 | 9.976 |
| 2.299645822427631 | -8.1 | -1.372 | 9.928 |
| 2.305929007734811 | -8.224 | -1.231 | 9.874 |
| 2.312212193041991 | -8.348 | -1.086 | 9.815 |
| 2.31849537834917 | -8.474 | -0.939 | 9.751 |
| 2.32477856365635 | -8.601 | -0.789 | 9.681 |
| 2.331061748963529 | -8.729 | -0.636 | 9.606 |
| 2.337344934270709 | -8.857 | -0.481 | 9.525 |
| 2.343628119577889 | -8.987 | -0.323 | 9.439 |
| 2.349911304885068 | -9.118 | -0.163 | 9.347 |
| 2.356194490192248 | -9.25 | 0 | 9.25 |
| 2.362477675499428 | -9.382 | 0.166 | 9.146 |
| 2.368760860806607 | -9.516 | 0.334 | 9.037 |
| 2.375044046113787 | -9.65 | 0.505 | 8.923 |
| 2.381327231420966 | -9.786 | 0.678 | 8.802 |
| 2.387610416728146 | -9.922 | 0.855 | 8.676 |
| 2.393893602035326 | -10.059 | 1.033 | 8.544 |
| 2.400176787342505 | -10.198 | 1.215 | 8.406 |
| 2.406459972649685 | -10.337 | 1.399 | 8.262 |
| 2.412743157956865 | -10.477 | 1.585 | 8.112 |
| 2.419026343264044 | -10.618 | 1.774 | 7.957 |
| 2.425309528571224 | -10.76 | 1.966 | 7.795 |
| 2.431592713878404 | -10.903 | 2.16 | 7.627 |
| 2.437875899185583 | -11.047 | 2.356 | 7.454 |
| 2.444159084492763 | -11.192 | 2.556 | 7.274 |
| 2.450442269799943 | -11.337 | 2.757 | 7.089 |
| 2.456725455107122 | -11.484 | 2.961 | 6.897 |
| 2.463008640414302 | -11.631 | 3.168 | 6.7 |
| 2.469291825721482 | -11.78 | 3.377 | 6.496 |
| 2.475575011028661 | -11.929 | 3.588 | 6.287 |
| 2.481858196335841 | -12.079 | 3.802 | 6.071 |
| 2.48814138164302 | -12.23 | 4.018 | 5.85 |
| 2.4944245669502 | -12.382 | 4.236 | 5.623 |
| 2.50070775225738 | -12.535 | 4.457 | 5.39 |
| 2.506990937564559 | -12.689 | 4.68 | 5.151 |
| 2.51327412287174 | -12.843 | 4.906 | 4.906 |
| 2.519557308178919 | -12.999 | 5.133 | 4.655 |
| 2.525840493486098 | -13.155 | 5.363 | 4.398 |
| 2.532123678793278 | -13.312 | 5.595 | 4.136 |
| 2.538406864100458 | -13.47 | 5.83 | 3.868 |
| 2.544690049407637 | -13.629 | 6.066 | 3.595 |
| 2.550973234714817 | -13.788 | 6.304 | 3.315 |
| 2.557256420021996 | -13.949 | 6.545 | 3.03 |
| 2.563539605329176 | -14.11 | 6.788 | 2.74 |
| 2.569822790636356 | -14.272 | 7.032 | 2.444 |
| 2.576105975943535 | -14.435 | 7.279 | 2.143 |
| 2.582389161250715 | -14.598 | 7.528 | 1.836 |
| 2.588672346557895 | -14.762 | 7.778 | 1.524 |
| 2.594955531865074 | -14.928 | 8.031 | 1.207 |
| 2.601238717172254 | -15.093 | 8.285 | 0.884 |
| 2.607521902479433 | -15.26 | 8.541 | 0.557 |
| 2.613805087786613 | -15.427 | 8.799 | 0.224 |
| 2.620088273093793 | -15.596 | 9.058 | -0.113 |
| 2.626371458400972 | -15.764 | 9.32 | -0.455 |
| 2.632654643708152 | -15.934 | 9.583 | -0.802 |
| 2.638937829015332 | -16.104 | 9.847 | -1.154 |
| 2.645221014322511 | -16.275 | 10.113 | -1.51 |
| 2.651504199629691 | -16.447 | 10.381 | -1.871 |
| 2.657787384936871 | -16.619 | 10.65 | -2.236 |
| 2.66407057024405 | -16.793 | 10.921 | -2.605 |
| 2.67035375555123 | -16.966 | 11.192 | -2.979 |
| 2.67663694085841 | -17.141 | 11.466 | -3.356 |
| 2.682920126165589 | -17.316 | 11.74 | -3.738 |
| 2.689203311472769 | -17.491 | 12.016 | -4.123 |
| 2.695486496779948 | -17.668 | 12.293 | -4.512 |
| 2.701769682087128 | -17.845 | 12.571 | -4.905 |
| 2.708052867394308 | -18.022 | 12.85 | -5.301 |
| 2.714336052701487 | -18.2 | 13.131 | -5.7 |
| 2.720619238008667 | -18.379 | 13.412 | -6.102 |
| 2.726902423315847 | -18.559 | 13.694 | -6.508 |
| 2.733185608623026 | -18.738 | 13.977 | -6.916 |
| 2.739468793930206 | -18.919 | 14.261 | -7.327 |
| 2.745751979237386 | -19.1 | 14.545 | -7.741 |
| 2.752035164544565 | -19.281 | 14.831 | -8.157 |
| 2.758318349851745 | -19.464 | 15.117 | -8.576 |
| 2.764601535158925 | -19.646 | 15.403 | -8.997 |
| 2.770884720466104 | -19.829 | 15.69 | -9.419 |
| 2.777167905773284 | -20.013 | 15.978 | -9.844 |
| 2.783451091080463 | -20.197 | 16.265 | -10.27 |
| 2.789734276387643 | -20.381 | 16.554 | -10.698 |
| 2.796017461694823 | -20.566 | 16.842 | -11.127 |
| 2.802300647002002 | -20.752 | 17.131 | -11.557 |
| 2.808583832309182 | -20.937 | 17.42 | -11.988 |
| 2.814867017616362 | -21.124 | 17.709 | -12.42 |
| 2.821150202923541 | -21.31 | 17.998 | -12.853 |
| 2.827433388230721 | -21.497 | 18.287 | -13.286 |
| 2.833716573537901 | -21.685 | 18.575 | -13.719 |
| 2.83999975884508 | -21.872 | 18.864 | -14.153 |
| 2.84628294415226 | -22.061 | 19.152 | -14.586 |
| 2.852566129459439 | -22.249 | 19.44 | -15.019 |
| 2.858849314766619 | -22.438 | 19.728 | -15.452 |
| 2.865132500073799 | -22.627 | 20.015 | -15.884 |
| 2.871415685380978 | -22.816 | 20.302 | -16.315 |
| 2.877698870688158 | -23.006 | 20.588 | -16.745 |
| 2.883982055995337 | -23.196 | 20.873 | -17.173 |
| 2.890265241302517 | -23.386 | 21.158 | -17.6 |
| 2.896548426609697 | -23.576 | 21.441 | -18.026 |
| 2.902831611916877 | -23.767 | 21.724 | -18.449 |
| 2.909114797224056 | -23.957 | 22.006 | -18.871 |
| 2.915397982531236 | -24.148 | 22.287 | -19.29 |
| 2.921681167838416 | -24.339 | 22.566 | -19.707 |
| 2.927964353145595 | -24.531 | 22.845 | -20.12 |
| 2.934247538452775 | -24.722 | 23.122 | -20.531 |
| 2.940530723759954 | -24.914 | 23.398 | -20.939 |
| 2.946813909067134 | -25.105 | 23.672 | -21.343 |
| 2.953097094374314 | -25.297 | 23.945 | -21.744 |
| 2.959380279681493 | -25.489 | 24.216 | -22.141 |
| 2.965663464988673 | -25.681 | 24.485 | -22.534 |
| 2.971946650295853 | -25.873 | 24.753 | -22.923 |
| 2.978229835603032 | -26.065 | 25.019 | -23.307 |
| 2.984513020910212 | -26.257 | 25.283 | -23.687 |
| 2.990796206217391 | -26.449 | 25.545 | -24.061 |
| 2.997079391524571 | -26.641 | 25.805 | -24.431 |
| 3.003362576831751 | -26.832 | 26.062 | -24.795 |
| 3.009645762138931 | -27.024 | 26.318 | -25.153 |
| 3.01592894744611 | -27.216 | 26.571 | -25.506 |
| 3.02221213275329 | -27.408 | 26.821 | -25.853 |
| 3.028495318060469 | -27.599 | 27.069 | -26.193 |
| 3.034778503367649 | -27.791 | 27.315 | -26.527 |
| 3.041061688674829 | -27.982 | 27.557 | -26.855 |
| 3.047344873982008 | -28.173 | 27.797 | -27.175 |
| 3.053628059289188 | -28.364 | 28.034 | -27.488 |
| 3.059911244596367 | -28.555 | 28.269 | -27.794 |
| 3.066194429903547 | -28.745 | 28.5 | -28.093 |
| 3.072477615210727 | -28.935 | 28.728 | -28.383 |
| 3.078760800517906 | -29.125 | 28.953 | -28.666 |
| 3.085043985825086 | -29.315 | 29.174 | -28.94 |
| 3.091327171132266 | -29.504 | 29.393 | -29.206 |
| 3.097610356439445 | -29.693 | 29.607 | -29.464 |
| 3.103893541746625 | -29.882 | 29.818 | -29.712 |
| 3.110176727053805 | -30.071 | 30.026 | -29.952 |
| 3.116459912360984 | -30.259 | 30.23 | -30.182 |
| 3.122743097668164 | -30.446 | 30.43 | -30.403 |
| 3.129026282975343 | -30.633 | 30.626 | -30.614 |
| 3.135309468282523 | -30.82 | 30.818 | -30.815 |
| 3.141592653589703 | -31.006 | 31.006 | -31.006 |
| 3.147875838896883 | -31.192 | 31.19 | -31.187 |
| 3.154159024204062 | -31.377 | 31.37 | -31.358 |
| 3.160442209511242 | -31.562 | 31.545 | -31.517 |
| 3.166725394818422 | -31.746 | 31.716 | -31.666 |
| 3.173008580125601 | -31.93 | 31.883 | -31.804 |
| 3.179291765432781 | -32.113 | 32.045 | -31.931 |
| 3.18557495073996 | -32.296 | 32.202 | -32.046 |
| 3.19185813604714 | -32.477 | 32.354 | -32.149 |
| 3.19814132135432 | -32.659 | 32.502 | -32.241 |
| 3.2044245066615 | -32.839 | 32.645 | -32.321 |
| 3.210707691968679 | -33.019 | 32.782 | -32.389 |
| 3.216990877275859 | -33.198 | 32.915 | -32.445 |
| 3.223274062583038 | -33.377 | 33.042 | -32.488 |
| 3.229557247890217 | -33.554 | 33.164 | -32.518 |
| 3.235840433197398 | -33.731 | 33.281 | -32.536 |
| 3.242123618504577 | -33.907 | 33.393 | -32.541 |
| 3.248406803811757 | -34.082 | 33.498 | -32.533 |
| 3.254689989118936 | -34.257 | 33.599 | -32.511 |
| 3.260973174426116 | -34.43 | 33.693 | -32.477 |
| 3.267256359733296 | -34.603 | 33.782 | -32.429 |
| 3.273539545040475 | -34.775 | 33.865 | -32.367 |
| 3.279822730347655 | -34.945 | 33.942 | -32.291 |
| 3.286105915654835 | -35.115 | 34.013 | -32.202 |
| 3.292389100962014 | -35.284 | 34.078 | -32.099 |
| 3.298672286269194 | -35.452 | 34.137 | -31.981 |
| 3.304955471576374 | -35.619 | 34.189 | -31.85 |
| 3.311238656883553 | -35.784 | 34.236 | -31.704 |
| 3.317521842190732 | -35.949 | 34.276 | -31.544 |
| 3.323805027497912 | -36.112 | 34.309 | -31.369 |
| 3.330088212805092 | -36.275 | 34.336 | -31.18 |
| 3.336371398112272 | -36.436 | 34.356 | -30.976 |
| 3.342654583419451 | -36.596 | 34.369 | -30.758 |
| 3.34893776872663 | -36.755 | 34.376 | -30.524 |
| 3.355220954033811 | -36.913 | 34.376 | -30.276 |
| 3.36150413934099 | -37.069 | 34.369 | -30.013 |
| 3.36778732464817 | -37.224 | 34.355 | -29.735 |
| 3.37407050995535 | -37.378 | 34.334 | -29.442 |
| 3.380353695262529 | -37.531 | 34.306 | -29.134 |
| 3.386636880569709 | -37.682 | 34.27 | -28.811 |
| 3.392920065876888 | -37.832 | 34.228 | -28.473 |
| 3.399203251184068 | -37.98 | 34.178 | -28.119 |
| 3.405486436491248 | -38.127 | 34.12 | -27.751 |
| 3.411769621798427 | -38.273 | 34.055 | -27.367 |
| 3.418052807105607 | -38.417 | 33.983 | -26.968 |
| 3.424335992412787 | -38.56 | 33.903 | -26.554 |
| 3.430619177719966 | -38.701 | 33.816 | -26.125 |
| 3.436902363027146 | -38.84 | 33.72 | -25.681 |
| 3.443185548334325 | -38.978 | 33.617 | -25.222 |
| 3.449468733641505 | -39.115 | 33.506 | -24.747 |
| 3.455751918948685 | -39.249 | 33.388 | -24.258 |
| 3.462035104255865 | -39.383 | 33.261 | -23.753 |
| 3.468318289563044 | -39.514 | 33.126 | -23.234 |
| 3.474601474870224 | -39.644 | 32.984 | -22.699 |
| 3.480884660177403 | -39.772 | 32.833 | -22.15 |
| 3.487167845484583 | -39.898 | 32.674 | -21.586 |
| 3.493451030791763 | -40.023 | 32.507 | -21.007 |
| 3.499734216098942 | -40.145 | 32.331 | -20.414 |
| 3.506017401406122 | -40.266 | 32.147 | -19.806 |
| 3.512300586713302 | -40.385 | 31.955 | -19.184 |
| 3.518583772020481 | -40.503 | 31.755 | -18.548 |
| 3.524866957327661 | -40.618 | 31.546 | -17.897 |
| 3.531150142634841 | -40.731 | 31.329 | -17.232 |
| 3.53743332794202 | -40.843 | 31.103 | -16.553 |
| 3.5437165132492 | -40.952 | 30.869 | -15.861 |
| 3.54999969855638 | -41.059 | 30.626 | -15.155 |
| 3.556282883863559 | -41.165 | 30.374 | -14.435 |
| 3.562566069170739 | -41.268 | 30.114 | -13.702 |
| 3.568849254477918 | -41.369 | 29.845 | -12.956 |
| 3.575132439785098 | -41.468 | 29.568 | -12.196 |
| 3.581415625092278 | -41.565 | 29.281 | -11.424 |
| 3.587698810399457 | -41.66 | 28.986 | -10.639 |
| 3.593981995706637 | -41.753 | 28.683 | -9.842 |
| 3.600265181013817 | -41.843 | 28.37 | -9.032 |
| 3.606548366320996 | -41.931 | 28.048 | -8.211 |
| 3.612831551628176 | -42.017 | 27.718 | -7.377 |
| 3.619114736935355 | -42.1 | 27.379 | -6.532 |
| 3.625397922242535 | -42.182 | 27.031 | -5.675 |
| 3.631681107549715 | -42.261 | 26.674 | -4.807 |
| 3.637964292856894 | -42.337 | 26.308 | -3.928 |
| 3.644247478164074 | -42.411 | 25.933 | -3.039 |
| 3.650530663471254 | -42.483 | 25.549 | -2.139 |
| 3.656813848778433 | -42.552 | 25.156 | -1.229 |
| 3.663097034085613 | -42.619 | 24.754 | -0.309 |
| 3.669380219392792 | -42.683 | 24.344 | 0.621 |
| 3.675663404699972 | -42.744 | 23.924 | 1.56 |
| 3.681946590007152 | -42.804 | 23.495 | 2.508 |
| 3.688229775314331 | -42.86 | 23.058 | 3.465 |
| 3.694512960621511 | -42.914 | 22.611 | 4.43 |
| 3.700796145928691 | -42.965 | 22.156 | 5.404 |
| 3.70707933123587 | -43.014 | 21.691 | 6.385 |
| 3.71336251654305 | -43.06 | 21.218 | 7.374 |
| 3.71964570185023 | -43.103 | 20.735 | 8.37 |
| 3.72592888715741 | -43.143 | 20.244 | 9.373 |
| 3.732212072464589 | -43.181 | 19.744 | 10.382 |
| 3.738495257771769 | -43.215 | 19.235 | 11.398 |
| 3.744778443078948 | -43.247 | 18.717 | 12.42 |
| 3.751061628386128 | -43.276 | 18.19 | 13.447 |
| 3.757344813693308 | -43.303 | 17.654 | 14.479 |
| 3.763627999000487 | -43.326 | 17.11 | 15.516 |
| 3.769911184307667 | -43.346 | 16.557 | 16.557 |
| 3.776194369614846 | -43.364 | 15.995 | 17.602 |
| 3.782477554922026 | -43.378 | 15.424 | 18.651 |
| 3.788760740229206 | -43.389 | 14.845 | 19.703 |
| 3.795043925536385 | -43.398 | 14.257 | 20.758 |
| 3.801327110843565 | -43.403 | 13.66 | 21.815 |
| 3.807610296150745 | -43.405 | 13.055 | 22.875 |
| 3.813893481457924 | -43.404 | 12.442 | 23.935 |
| 3.820176666765104 | -43.4 | 11.82 | 24.998 |
| 3.826459852072284 | -43.392 | 11.189 | 26.061 |
| 3.832743037379463 | -43.382 | 10.55 | 27.124 |
| 3.839026222686643 | -43.368 | 9.903 | 28.187 |
| 3.845309407993823 | -43.351 | 9.247 | 29.25 |
| 3.851592593301002 | -43.331 | 8.584 | 30.312 |
| 3.857875778608182 | -43.307 | 7.912 | 31.373 |
| 3.864158963915361 | -43.28 | 7.232 | 32.431 |
| 3.870442149222541 | -43.25 | 6.543 | 33.488 |
| 3.876725334529721 | -43.216 | 5.847 | 34.542 |
| 3.8830085198369 | -43.179 | 5.143 | 35.593 |
| 3.88929170514408 | -43.139 | 4.432 | 36.64 |
| 3.89557489045126 | -43.095 | 3.712 | 37.683 |
| 3.901858075758439 | -43.047 | 2.985 | 38.721 |
| 3.908141261065619 | -42.996 | 2.25 | 39.755 |
| 3.914424446372799 | -42.942 | 1.507 | 40.783 |
| 3.920707631679978 | -42.883 | 0.757 | 41.806 |
| 3.926990816987158 | -42.822 | 0 | 42.822 |
| 3.933274002294337 | -42.756 | -0.765 | 43.831 |
| 3.939557187601517 | -42.687 | -1.537 | 44.833 |
| 3.945840372908697 | -42.615 | -2.316 | 45.827 |
| 3.952123558215876 | -42.539 | -3.102 | 46.813 |
| 3.958406743523056 | -42.458 | -3.895 | 47.79 |
| 3.964689928830236 | -42.375 | -4.694 | 48.759 |
| 3.970973114137415 | -42.287 | -5.501 | 49.717 |
| 3.977256299444595 | -42.196 | -6.314 | 50.666 |
| 3.983539484751775 | -42.101 | -7.134 | 51.603 |
| 3.989822670058954 | -42.002 | -7.96 | 52.53 |
| 3.996105855366134 | -41.899 | -8.793 | 53.445 |
| 4.002389040673314 | -41.792 | -9.632 | 54.349 |
| 4.008672225980493 | -41.682 | -10.477 | 55.239 |
| 4.014955411287672 | -41.567 | -11.328 | 56.117 |
| 4.021238596594851 | -41.448 | -12.184 | 56.982 |
| 4.02752178190203 | -41.326 | -13.047 | 57.832 |
| 4.03380496720921 | -41.199 | -13.915 | 58.669 |
| 4.040088152516389 | -41.069 | -14.789 | 59.49 |
| 4.046371337823567 | -40.934 | -15.668 | 60.296 |
| 4.052654523130747 | -40.796 | -16.553 | 61.087 |
| 4.058937708437926 | -40.653 | -17.443 | 61.861 |
| 4.065220893745105 | -40.506 | -18.337 | 62.618 |
| 4.071504079052285 | -40.355 | -19.237 | 63.359 |
| 4.077787264359464 | -40.2 | -20.141 | 64.082 |
| 4.084070449666643 | -40.04 | -21.05 | 64.787 |
| 4.090353634973822 | -39.877 | -21.964 | 65.473 |
| 4.096636820281001 | -39.709 | -22.882 | 66.141 |
| 4.102920005588181 | -39.537 | -23.804 | 66.789 |
| 4.10920319089536 | -39.361 | -24.73 | 67.418 |
| 4.115486376202539 | -39.18 | -25.66 | 68.026 |
| 4.121769561509718 | -38.995 | -26.594 | 68.614 |
| 4.128052746816897 | -38.806 | -27.531 | 69.181 |
| 4.134335932124077 | -38.612 | -28.472 | 69.726 |
| 4.140619117431256 | -38.414 | -29.416 | 70.25 |
| 4.146902302738435 | -38.212 | -30.364 | 70.751 |
| 4.153185488045614 | -38.005 | -31.314 | 71.23 |
| 4.159468673352793 | -37.794 | -32.267 | 71.685 |
| 4.165751858659973 | -37.578 | -33.223 | 72.118 |
| 4.172035043967152 | -37.358 | -34.182 | 72.526 |
| 4.178318229274331 | -37.133 | -35.142 | 72.911 |
| 4.18460141458151 | -36.904 | -36.105 | 73.27 |
| 4.190884599888689 | -36.67 | -37.07 | 73.605 |
| 4.197167785195868 | -36.431 | -38.037 | 73.915 |
| 4.203450970503048 | -36.188 | -39.005 | 74.199 |
| 4.209734155810227 | -35.941 | -39.975 | 74.457 |
| 4.216017341117406 | -35.689 | -40.946 | 74.689 |
| 4.222300526424585 | -35.432 | -41.918 | 74.894 |
| 4.228583711731764 | -35.171 | -42.892 | 75.073 |
| 4.234866897038944 | -34.904 | -43.866 | 75.224 |
| 4.241150082346122 | -34.634 | -44.84 | 75.348 |
| 4.247433267653302 | -34.358 | -45.815 | 75.444 |
| 4.253716452960481 | -34.078 | -46.791 | 75.512 |
| 4.25999963826766 | -33.793 | -47.766 | 75.551 |
| 4.26628282357484 | -33.503 | -48.741 | 75.562 |
| 4.272566008882019 | -33.209 | -49.716 | 75.545 |
| 4.278849194189198 | -32.909 | -50.69 | 75.498 |
| 4.285132379496377 | -32.605 | -51.664 | 75.421 |
| 4.291415564803557 | -32.296 | -52.636 | 75.316 |
| 4.297698750110735 | -31.982 | -53.608 | 75.18 |
| 4.303981935417915 | -31.664 | -54.578 | 75.015 |
| 4.310265120725094 | -31.34 | -55.546 | 74.819 |
| 4.316548306032273 | -31.012 | -56.513 | 74.593 |
| 4.322831491339452 | -30.679 | -57.478 | 74.337 |
| 4.329114676646632 | -30.34 | -58.441 | 74.049 |
| 4.335397861953811 | -29.997 | -59.401 | 73.731 |
| 4.34168104726099 | -29.649 | -60.359 | 73.382 |
| 4.347964232568169 | -29.296 | -61.314 | 73.002 |
| 4.354247417875348 | -28.938 | -62.267 | 72.591 |
| 4.360530603182528 | -28.575 | -63.216 | 72.149 |
| 4.366813788489707 | -28.207 | -64.161 | 71.675 |
| 4.373096973796886 | -27.834 | -65.104 | 71.17 |
| 4.379380159104065 | -27.456 | -66.042 | 70.633 |
| 4.385663344411244 | -27.073 | -66.976 | 70.064 |
| 4.391946529718424 | -26.685 | -67.906 | 69.464 |
| 4.398229715025602 | -26.292 | -68.832 | 68.832 |
| 4.404512900332782 | -25.893 | -69.753 | 68.169 |
| 4.41079608563996 | -25.49 | -70.669 | 67.473 |
| 4.41707927094714 | -25.081 | -71.581 | 66.747 |
| 4.42336245625432 | -24.668 | -72.486 | 65.988 |
| 4.429645641561499 | -24.249 | -73.387 | 65.198 |
| 4.435928826868678 | -23.825 | -74.281 | 64.376 |
| 4.442212012175857 | -23.396 | -75.17 | 63.523 |
| 4.448495197483036 | -22.962 | -76.053 | 62.638 |
| 4.454778382790215 | -22.523 | -76.929 | 61.722 |
| 4.461061568097395 | -22.079 | -77.798 | 60.774 |
| 4.467344753404574 | -21.629 | -78.661 | 59.795 |
| 4.473627938711753 | -21.174 | -79.517 | 58.786 |
| 4.479911124018932 | -20.714 | -80.365 | 57.745 |
| 4.486194309326112 | -20.249 | -81.206 | 56.674 |
| 4.49247749463329 | -19.779 | -82.04 | 55.572 |
| 4.49876067994047 | -19.303 | -82.865 | 54.439 |
| 4.50504386524765 | -18.822 | -83.682 | 53.276 |
| 4.511327050554828 | -18.336 | -84.491 | 52.084 |
| 4.517610235862008 | -17.845 | -85.291 | 50.861 |
| 4.523893421169186 | -17.349 | -86.083 | 49.609 |
| 4.530176606476366 | -16.847 | -86.865 | 48.328 |
| 4.536459791783545 | -16.34 | -87.638 | 47.017 |
| 4.542742977090724 | -15.828 | -88.402 | 45.678 |
| 4.549026162397904 | -15.31 | -89.156 | 44.31 |
| 4.555309347705083 | -14.787 | -89.9 | 42.914 |
| 4.561592533012262 | -14.259 | -90.634 | 41.49 |
| 4.567875718319441 | -13.726 | -91.358 | 40.039 |
| 4.57415890362662 | -13.187 | -92.071 | 38.56 |
| 4.5804420889338 | -12.643 | -92.773 | 37.055 |
| 4.586725274240979 | -12.094 | -93.464 | 35.522 |
| 4.593008459548158 | -11.54 | -94.144 | 33.964 |
| 4.599291644855337 | -10.98 | -94.813 | 32.38 |
| 4.605574830162516 | -10.415 | -95.47 | 30.771 |
| 4.611858015469695 | -9.845 | -96.115 | 29.137 |
| 4.618141200776875 | -9.269 | -96.748 | 27.478 |
| 4.624424386084054 | -8.688 | -97.368 | 25.796 |
| 4.630707571391233 | -8.102 | -97.976 | 24.09 |
| 4.636990756698412 | -7.51 | -98.572 | 22.36 |
| 4.643273942005591 | -6.914 | -99.154 | 20.609 |
| 4.649557127312771 | -6.311 | -99.723 | 18.835 |
| 4.65584031261995 | -5.704 | -100.279 | 17.039 |
| 4.66212349792713 | -5.091 | -100.821 | 15.223 |
| 4.668406683234308 | -4.473 | -101.35 | 13.386 |
| 4.674689868541487 | -3.85 | -101.864 | 11.529 |
| 4.680973053848666 | -3.222 | -102.365 | 9.652 |
| 4.687256239155846 | -2.588 | -102.851 | 7.757 |
| 4.693539424463024 | -1.949 | -103.322 | 5.844 |
| 4.699822609770204 | -1.304 | -103.778 | 3.913 |
| 4.706105795077383 | -0.655 | -104.22 | 1.965 |
| 4.712388980384562 | 0 | -104.646 | 0 |
| 4.718672165691741 | 0.66 | -105.057 | -1.98 |
| 4.724955350998921 | 1.326 | -105.452 | -3.976 |
| 4.7312385363061 | 1.996 | -105.832 | -5.986 |
| 4.73752172161328 | 2.672 | -106.195 | -8.009 |
| 4.743804906920459 | 3.353 | -106.542 | -10.046 |
| 4.750088092227637 | 4.04 | -106.873 | -12.096 |
| 4.756371277534817 | 4.731 | -107.188 | -14.157 |
| 4.762654462841996 | 5.428 | -107.485 | -16.229 |
| 4.768937648149175 | 6.13 | -107.766 | -18.311 |
| 4.775220833456354 | 6.837 | -108.029 | -20.404 |
| 4.781504018763534 | 7.55 | -108.276 | -22.505 |
| 4.787787204070713 | 8.267 | -108.505 | -24.614 |
| 4.794070389377892 | 8.99 | -108.716 | -26.73 |
| 4.800353574685071 | 9.718 | -108.909 | -28.853 |
| 4.806636759992251 | 10.451 | -109.084 | -30.982 |
| 4.81291994529943 | 11.189 | -109.242 | -33.116 |
| 4.819203130606608 | 11.932 | -109.38 | -35.255 |
| 4.825486315913788 | 12.681 | -109.501 | -37.397 |
| 4.831769501220967 | 13.434 | -109.602 | -39.541 |
| 4.838052686528146 | 14.193 | -109.685 | -41.688 |
| 4.844335871835326 | 14.957 | -109.749 | -43.835 |
| 4.850619057142505 | 15.726 | -109.794 | -45.983 |
| 4.856902242449684 | 16.5 | -109.82 | -48.13 |
| 4.863185427756863 | 17.279 | -109.826 | -50.276 |
| 4.869468613064042 | 18.062 | -109.812 | -52.419 |
| 4.875751798371221 | 18.851 | -109.779 | -54.56 |
| 4.882034983678401 | 19.645 | -109.726 | -56.696 |
| 4.88831816898558 | 20.444 | -109.653 | -58.828 |
| 4.894601354292759 | 21.248 | -109.56 | -60.954 |
| 4.900884539599939 | 22.057 | -109.447 | -63.074 |
| 4.907167724907117 | 22.871 | -109.313 | -65.186 |
| 4.913450910214297 | 23.69 | -109.158 | -67.29 |
| 4.919734095521476 | 24.513 | -108.983 | -69.385 |
| 4.926017280828655 | 25.342 | -108.788 | -71.469 |
| 4.932300466135834 | 26.175 | -108.571 | -73.543 |
| 4.938583651443014 | 27.013 | -108.333 | -75.606 |
| 4.944866836750193 | 27.856 | -108.075 | -77.655 |
| 4.951150022057372 | 28.704 | -107.795 | -79.691 |
| 4.957433207364551 | 29.557 | -107.494 | -81.713 |
| 4.96371639267173 | 30.414 | -107.171 | -83.719 |
| 4.96999957797891 | 31.277 | -106.827 | -85.709 |
| 4.976282763286088 | 32.143 | -106.461 | -87.682 |
| 4.982565948593268 | 33.015 | -106.073 | -89.637 |
| 4.988849133900447 | 33.891 | -105.664 | -91.574 |
| 4.995132319207626 | 34.772 | -105.233 | -93.49 |
| 5.001415504514805 | 35.658 | -104.78 | -95.386 |
| 5.007698689821984 | 36.548 | -104.305 | -97.261 |
| 5.013981875129164 | 37.443 | -103.808 | -99.113 |
| 5.020265060436343 | 38.342 | -103.288 | -100.942 |
| 5.026548245743522 | 39.246 | -102.747 | -102.747 |
| 5.032831431050702 | 40.154 | -102.183 | -104.526 |
| 5.039114616357881 | 41.067 | -101.596 | -106.28 |
| 5.04539780166506 | 41.984 | -100.988 | -108.007 |
| 5.05168098697224 | 42.906 | -100.356 | -109.707 |
| 5.057964172279418 | 43.832 | -99.703 | -111.378 |
| 5.064247357586598 | 44.762 | -99.027 | -113.02 |
| 5.070530542893777 | 45.697 | -98.328 | -114.632 |
| 5.076813728200956 | 46.636 | -97.606 | -116.213 |
| 5.083096913508135 | 47.58 | -96.862 | -117.762 |
| 5.089380098815314 | 48.528 | -96.096 | -119.278 |
| 5.095663284122493 | 49.48 | -95.306 | -120.761 |
| 5.101946469429673 | 50.436 | -94.494 | -122.209 |
| 5.108229654736852 | 51.396 | -93.659 | -123.623 |
| 5.114512840044031 | 52.361 | -92.802 | -125.001 |
| 5.12079602535121 | 53.329 | -91.921 | -126.342 |
| 5.12707921065839 | 54.302 | -91.018 | -127.645 |
| 5.133362395965568 | 55.279 | -90.092 | -128.911 |
| 5.139645581272747 | 56.259 | -89.144 | -130.137 |
| 5.145928766579927 | 57.244 | -88.172 | -131.324 |
| 5.152211951887106 | 58.233 | -87.179 | -132.47 |
| 5.158495137194286 | 59.225 | -86.162 | -133.575 |
| 5.164778322501465 | 60.221 | -85.123 | -134.638 |
| 5.171061507808644 | 61.222 | -84.061 | -135.659 |
| 5.177344693115823 | 62.226 | -82.976 | -136.636 |
| 5.183627878423002 | 63.234 | -81.869 | -137.569 |
| 5.189911063730181 | 64.245 | -80.74 | -138.458 |
| 5.196194249037361 | 65.26 | -79.588 | -139.301 |
| 5.20247743434454 | 66.279 | -78.413 | -140.098 |
| 5.20876061965172 | 67.302 | -77.216 | -140.849 |
| 5.215043804958898 | 68.328 | -75.997 | -141.552 |
| 5.221326990266077 | 69.358 | -74.756 | -142.207 |
| 5.227610175573257 | 70.391 | -73.493 | -142.815 |
| 5.233893360880435 | 71.427 | -72.207 | -143.373 |
| 5.240176546187615 | 72.468 | -70.9 | -143.881 |
| 5.246459731494794 | 73.511 | -69.57 | -144.339 |
| 5.252742916801973 | 74.558 | -68.219 | -144.747 |
| 5.259026102109152 | 75.608 | -66.846 | -145.103 |
| 5.265309287416332 | 76.661 | -65.452 | -145.408 |
| 5.27159247272351 | 77.718 | -64.036 | -145.661 |
| 5.27787565803069 | 78.777 | -62.598 | -145.861 |
| 5.284158843337869 | 79.84 | -61.139 | -146.008 |
| 5.290442028645049 | 80.906 | -59.66 | -146.102 |
| 5.296725213952227 | 81.975 | -58.159 | -146.141 |
| 5.303008399259407 | 83.047 | -56.637 | -146.126 |
| 5.309291584566586 | 84.122 | -55.094 | -146.057 |
| 5.315574769873765 | 85.2 | -53.531 | -145.933 |
| 5.321857955180945 | 86.281 | -51.947 | -145.753 |
| 5.328141140488124 | 87.364 | -50.343 | -145.517 |
| 5.334424325795303 | 88.451 | -48.718 | -145.226 |
| 5.340707511102482 | 89.54 | -47.074 | -144.878 |
| 5.346990696409661 | 90.631 | -45.409 | -144.474 |
| 5.35327388171684 | 91.726 | -43.725 | -144.013 |
| 5.35955706702402 | 92.823 | -42.022 | -143.495 |
| 5.365840252331199 | 93.922 | -40.299 | -142.919 |
| 5.372123437638378 | 95.024 | -38.556 | -142.287 |
| 5.378406622945557 | 96.128 | -36.795 | -141.597 |
| 5.384689808252737 | 97.235 | -35.015 | -140.849 |
| 5.390972993559916 | 98.344 | -33.216 | -140.043 |
| 5.397256178867095 | 99.455 | -31.399 | -139.18 |
| 5.403539364174274 | 100.569 | -29.564 | -138.258 |
| 5.409822549481453 | 101.685 | -27.71 | -137.279 |
| 5.416105734788632 | 102.802 | -25.839 | -136.241 |
| 5.422388920095812 | 103.922 | -23.951 | -135.146 |
| 5.42867210540299 | 105.044 | -22.044 | -133.992 |
| 5.43495529071017 | 106.168 | -20.121 | -132.781 |
| 5.44123847601735 | 107.294 | -18.181 | -131.512 |
| 5.447521661324528 | 108.422 | -16.224 | -130.184 |
| 5.453804846631708 | 109.551 | -14.251 | -128.799 |
| 5.460088031938887 | 110.682 | -12.262 | -127.357 |
| 5.466371217246066 | 111.815 | -10.256 | -125.857 |
| 5.472654402553245 | 112.95 | -8.235 | -124.3 |
| 5.478937587860424 | 114.086 | -6.199 | -122.686 |
| 5.485220773167603 | 115.223 | -4.147 | -121.015 |
| 5.491503958474783 | 116.362 | -2.081 | -119.287 |
| 5.497787143781962 | 117.503 | 0 | -117.503 |
| 5.504070329089141 | 118.645 | 2.095 | -115.663 |
| 5.51035351439632 | 119.788 | 4.205 | -113.767 |
| 5.5166366997035 | 120.932 | 6.328 | -111.816 |
| 5.522919885010679 | 122.078 | 8.464 | -109.81 |
| 5.529203070317858 | 123.224 | 10.614 | -107.75 |
| 5.535486255625037 | 124.372 | 12.777 | -105.635 |
| 5.541769440932216 | 125.521 | 14.952 | -103.466 |
| 5.548052626239396 | 126.67 | 17.139 | -101.245 |
| 5.554335811546575 | 127.821 | 19.338 | -98.97 |
| 5.560618996853754 | 128.972 | 21.549 | -96.643 |
| 5.566902182160933 | 130.124 | 23.772 | -94.264 |
| 5.573185367468112 | 131.276 | 26.005 | -91.834 |
| 5.579468552775292 | 132.43 | 28.249 | -89.354 |
| 5.585751738082471 | 133.584 | 30.503 | -86.823 |
| 5.59203492338965 | 134.738 | 32.767 | -84.243 |
| 5.59831810869683 | 135.893 | 35.041 | -81.614 |
| 5.604601294004008 | 137.048 | 37.324 | -78.938 |
| 5.610884479311188 | 138.203 | 39.616 | -76.213 |
| 5.617167664618367 | 139.359 | 41.916 | -73.442 |
| 5.623450849925546 | 140.514 | 44.225 | -70.625 |
| 5.629734035232725 | 141.67 | 46.541 | -67.763 |
| 5.636017220539904 | 142.826 | 48.866 | -64.857 |
| 5.642300405847083 | 143.982 | 51.197 | -61.907 |
| 5.648583591154263 | 145.138 | 53.535 | -58.914 |
| 5.654866776461442 | 146.293 | 55.879 | -55.879 |
| 5.661149961768621 | 147.449 | 58.229 | -52.803 |
| 5.6674331470758 | 148.604 | 60.585 | -49.687 |
| 5.673716332382979 | 149.758 | 62.947 | -46.532 |
| 5.679999517690159 | 150.913 | 65.313 | -43.339 |
| 5.686282702997337 | 152.066 | 67.683 | -40.108 |
| 5.692565888304517 | 153.219 | 70.058 | -36.84 |
| 5.698849073611696 | 154.372 | 72.436 | -33.538 |
| 5.705132258918875 | 155.524 | 74.817 | -30.201 |
| 5.711415444226055 | 156.675 | 77.201 | -26.83 |
| 5.717698629533234 | 157.825 | 79.588 | -23.428 |
| 5.723981814840413 | 158.974 | 81.977 | -19.994 |
| 5.730265000147592 | 160.122 | 84.367 | -16.53 |
| 5.73654818545477 | 161.269 | 86.759 | -13.037 |
| 5.742831370761951 | 162.415 | 89.151 | -9.516 |
| 5.74911455606913 | 163.56 | 91.544 | -5.969 |
| 5.75539774137631 | 164.703 | 93.936 | -2.396 |
| 5.761680926683488 | 165.845 | 96.328 | 1.202 |
| 5.767964111990667 | 166.985 | 98.719 | 4.822 |
| 5.774247297297846 | 168.124 | 101.109 | 8.465 |
| 5.780530482605025 | 169.262 | 103.497 | 12.128 |
| 5.786813667912205 | 170.398 | 105.883 | 15.811 |
| 5.793096853219384 | 171.532 | 108.266 | 19.512 |
| 5.799380038526563 | 172.664 | 110.645 | 23.23 |
| 5.805663223833742 | 173.794 | 113.022 | 26.963 |
| 5.811946409140922 | 174.923 | 115.394 | 30.711 |
| 5.8182295944481 | 176.049 | 117.762 | 34.472 |
| 5.82451277975528 | 177.173 | 120.125 | 38.245 |
| 5.830795965062459 | 178.295 | 122.482 | 42.028 |
| 5.837079150369638 | 179.415 | 124.834 | 45.819 |
| 5.843362335676817 | 180.532 | 127.179 | 49.619 |
| 5.849645520983997 | 181.647 | 129.518 | 53.424 |
| 5.855928706291176 | 182.759 | 131.85 | 57.235 |
| 5.862211891598355 | 183.869 | 134.173 | 61.049 |
| 5.868495076905535 | 184.976 | 136.489 | 64.865 |
| 5.874778262212714 | 186.081 | 138.796 | 68.681 |
| 5.881061447519893 | 187.182 | 141.094 | 72.497 |
| 5.887344632827072 | 188.281 | 143.383 | 76.31 |
| 5.893627818134251 | 189.377 | 145.662 | 80.12 |
| 5.899911003441431 | 190.469 | 147.93 | 83.924 |
| 5.90619418874861 | 191.559 | 150.187 | 87.722 |
| 5.912477374055789 | 192.645 | 152.433 | 91.511 |
| 5.918760559362968 | 193.728 | 154.667 | 95.291 |
| 5.925043744670147 | 194.807 | 156.888 | 99.06 |
| 5.931326929977326 | 195.884 | 159.097 | 102.816 |
| 5.937610115284505 | 196.956 | 161.293 | 106.559 |
| 5.943893300591684 | 198.025 | 163.475 | 110.285 |
| 5.950176485898864 | 199.09 | 165.642 | 113.995 |
| 5.956459671206043 | 200.152 | 167.795 | 117.685 |
| 5.962742856513223 | 201.209 | 169.933 | 121.356 |
| 5.969026041820402 | 202.263 | 172.055 | 125.005 |
| 5.975309227127581 | 203.313 | 174.161 | 128.632 |
| 5.98159241243476 | 204.358 | 176.251 | 132.233 |
| 5.987875597741939 | 205.4 | 178.323 | 135.809 |
| 5.994158783049118 | 206.437 | 180.378 | 139.356 |
| 6.000441968356298 | 207.469 | 182.415 | 142.875 |
| 6.006725153663476 | 208.497 | 184.434 | 146.363 |
| 6.013008338970656 | 209.521 | 186.433 | 149.819 |
| 6.019291524277835 | 210.54 | 188.413 | 153.241 |
| 6.025574709585015 | 211.555 | 190.373 | 156.628 |
| 6.031857894892193 | 212.564 | 192.313 | 159.979 |
| 6.038141080199372 | 213.569 | 194.232 | 163.291 |
| 6.044424265506552 | 214.569 | 196.13 | 166.564 |
| 6.050707450813731 | 215.564 | 198.006 | 169.796 |
| 6.05699063612091 | 216.553 | 199.86 | 172.985 |
| 6.06327382142809 | 217.538 | 201.691 | 176.13 |
| 6.069557006735269 | 218.517 | 203.499 | 179.23 |
| 6.075840192042448 | 219.491 | 205.284 | 182.283 |
| 6.082123377349627 | 220.459 | 207.044 | 185.288 |
| 6.088406562656806 | 221.422 | 208.78 | 188.243 |
| 6.094689747963986 | 222.379 | 210.491 | 191.146 |
| 6.100972933271164 | 223.33 | 212.176 | 193.998 |
| 6.107256118578344 | 224.276 | 213.836 | 196.795 |
| 6.113539303885523 | 225.216 | 215.469 | 199.537 |
| 6.119822489192702 | 226.149 | 217.076 | 202.222 |
| 6.126105674499882 | 227.077 | 218.655 | 204.849 |
| 6.132388859807061 | 227.999 | 220.207 | 207.417 |
| 6.13867204511424 | 228.914 | 221.73 | 209.924 |
| 6.144955230421419 | 229.823 | 223.225 | 212.369 |
| 6.151238415728598 | 230.726 | 224.692 | 214.751 |
| 6.157521601035778 | 231.622 | 226.128 | 217.068 |
| 6.163804786342957 | 232.512 | 227.535 | 219.32 |
| 6.170087971650136 | 233.394 | 228.912 | 221.504 |
| 6.176371156957315 | 234.271 | 230.258 | 223.62 |
| 6.182654342264494 | 235.14 | 231.572 | 225.666 |
| 6.188937527571674 | 236.002 | 232.856 | 227.642 |
| 6.195220712878853 | 236.858 | 234.107 | 229.546 |
| 6.201503898186032 | 237.706 | 235.326 | 231.377 |
| 6.207787083493211 | 238.547 | 236.512 | 233.133 |
| 6.21407026880039 | 239.381 | 237.665 | 234.815 |
| 6.22035345410757 | 240.208 | 238.785 | 236.42 |
| 6.226636639414749 | 241.027 | 239.871 | 237.947 |
| 6.232919824721928 | 241.839 | 240.922 | 239.397 |
| 6.239203010029107 | 242.643 | 241.938 | 240.766 |
| 6.245486195336286 | 243.439 | 242.92 | 242.056 |
| 6.251769380643465 | 244.227 | 243.866 | 243.264 |
| 6.258052565950644 | 245.008 | 244.776 | 244.389 |
| 6.264335751257824 | 245.781 | 245.65 | 245.432 |
| 6.270618936565003 | 246.545 | 246.487 | 246.39 |
| 6.276902121872182 | 247.302 | 247.287 | 247.263 |
| 6.283185307179361 | 248.05 | 248.05 | 248.05 |